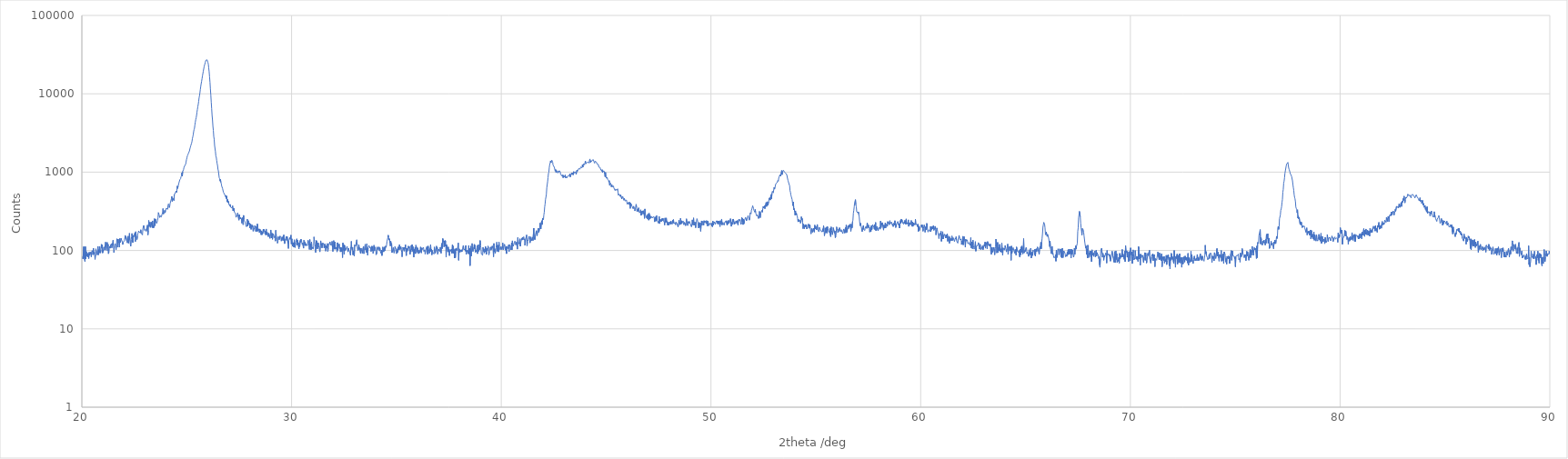
| Category | [Measurement conditions] |
|---|---|
| 20.01 | 78 |
| 20.03 | 83 |
| 20.05 | 78 |
| 20.07 | 79 |
| 20.09 | 112 |
| 20.11 | 80 |
| 20.13 | 75 |
| 20.15 | 72 |
| 20.17 | 112 |
| 20.19 | 78 |
| 20.21 | 97 |
| 20.23 | 92 |
| 20.25 | 84 |
| 20.27 | 92 |
| 20.29 | 82 |
| 20.31 | 91 |
| 20.33 | 79 |
| 20.35 | 95 |
| 20.37 | 87 |
| 20.39 | 90 |
| 20.41 | 95 |
| 20.43 | 90 |
| 20.45 | 83 |
| 20.47 | 96 |
| 20.49 | 100 |
| 20.51 | 95 |
| 20.53 | 88 |
| 20.55 | 107 |
| 20.57 | 91 |
| 20.59 | 95 |
| 20.61 | 89 |
| 20.63 | 77 |
| 20.65 | 89 |
| 20.67 | 105 |
| 20.69 | 93 |
| 20.71 | 93 |
| 20.73 | 88 |
| 20.75 | 99 |
| 20.77 | 113 |
| 20.79 | 88 |
| 20.81 | 102 |
| 20.83 | 93 |
| 20.85 | 112 |
| 20.87 | 96 |
| 20.89 | 93 |
| 20.91 | 101 |
| 20.93 | 120 |
| 20.95 | 107 |
| 20.97 | 118 |
| 20.99 | 93 |
| 21.01 | 95 |
| 21.03 | 102 |
| 21.05 | 111 |
| 21.07 | 101 |
| 21.09 | 105 |
| 21.11 | 103 |
| 21.13 | 128 |
| 21.15 | 101 |
| 21.17 | 112 |
| 21.19 | 110 |
| 21.21 | 127 |
| 21.23 | 99 |
| 21.25 | 120 |
| 21.27 | 91 |
| 21.29 | 95 |
| 21.31 | 106 |
| 21.33 | 113 |
| 21.35 | 107 |
| 21.37 | 118 |
| 21.39 | 120 |
| 21.41 | 122 |
| 21.43 | 108 |
| 21.45 | 123 |
| 21.47 | 118 |
| 21.49 | 135 |
| 21.51 | 115 |
| 21.53 | 94 |
| 21.55 | 113 |
| 21.57 | 118 |
| 21.59 | 121 |
| 21.61 | 122 |
| 21.63 | 102 |
| 21.65 | 117 |
| 21.67 | 141 |
| 21.69 | 134 |
| 21.71 | 110 |
| 21.73 | 140 |
| 21.75 | 130 |
| 21.77 | 123 |
| 21.79 | 110 |
| 21.81 | 142 |
| 21.83 | 126 |
| 21.85 | 130 |
| 21.87 | 143 |
| 21.89 | 137 |
| 21.91 | 140 |
| 21.93 | 129 |
| 21.95 | 119 |
| 21.97 | 127 |
| 21.99 | 125 |
| 22.01 | 127 |
| 22.03 | 134 |
| 22.05 | 134 |
| 22.07 | 156 |
| 22.09 | 142 |
| 22.11 | 149 |
| 22.13 | 134 |
| 22.15 | 130 |
| 22.17 | 125 |
| 22.19 | 144 |
| 22.21 | 153 |
| 22.23 | 124 |
| 22.25 | 142 |
| 22.27 | 166 |
| 22.29 | 137 |
| 22.31 | 121 |
| 22.33 | 113 |
| 22.35 | 137 |
| 22.37 | 149 |
| 22.39 | 165 |
| 22.41 | 164 |
| 22.43 | 126 |
| 22.45 | 156 |
| 22.47 | 149 |
| 22.49 | 156 |
| 22.51 | 153 |
| 22.53 | 168 |
| 22.55 | 130 |
| 22.57 | 174 |
| 22.59 | 157 |
| 22.61 | 153 |
| 22.63 | 138 |
| 22.65 | 152 |
| 22.67 | 163 |
| 22.69 | 166 |
| 22.71 | 178 |
| 22.73 | 172 |
| 22.75 | 169 |
| 22.77 | 170 |
| 22.79 | 168 |
| 22.81 | 184 |
| 22.83 | 166 |
| 22.85 | 170 |
| 22.87 | 163 |
| 22.89 | 158 |
| 22.91 | 191 |
| 22.93 | 190 |
| 22.95 | 209 |
| 22.97 | 186 |
| 22.99 | 180 |
| 23.01 | 176 |
| 23.03 | 178 |
| 23.05 | 187 |
| 23.07 | 176 |
| 23.09 | 192 |
| 23.11 | 191 |
| 23.13 | 211 |
| 23.15 | 158 |
| 23.17 | 180 |
| 23.19 | 242 |
| 23.21 | 202 |
| 23.23 | 216 |
| 23.25 | 230 |
| 23.27 | 197 |
| 23.29 | 212 |
| 23.31 | 230 |
| 23.33 | 210 |
| 23.35 | 197 |
| 23.37 | 239 |
| 23.39 | 194 |
| 23.41 | 207 |
| 23.43 | 196 |
| 23.45 | 254 |
| 23.47 | 237 |
| 23.49 | 207 |
| 23.51 | 253 |
| 23.53 | 235 |
| 23.55 | 241 |
| 23.57 | 222 |
| 23.59 | 226 |
| 23.61 | 241 |
| 23.63 | 260 |
| 23.65 | 305 |
| 23.67 | 296 |
| 23.69 | 279 |
| 23.71 | 264 |
| 23.73 | 277 |
| 23.75 | 275 |
| 23.77 | 283 |
| 23.79 | 268 |
| 23.81 | 268 |
| 23.83 | 295 |
| 23.85 | 304 |
| 23.87 | 343 |
| 23.89 | 291 |
| 23.91 | 288 |
| 23.93 | 302 |
| 23.95 | 325 |
| 23.97 | 303 |
| 23.99 | 324 |
| 24.01 | 320 |
| 24.03 | 347 |
| 24.05 | 339 |
| 24.07 | 349 |
| 24.09 | 335 |
| 24.11 | 378 |
| 24.13 | 394 |
| 24.15 | 382 |
| 24.17 | 353 |
| 24.19 | 370 |
| 24.21 | 399 |
| 24.23 | 404 |
| 24.25 | 395 |
| 24.27 | 458 |
| 24.29 | 491 |
| 24.31 | 424 |
| 24.33 | 467 |
| 24.35 | 469 |
| 24.37 | 465 |
| 24.39 | 433 |
| 24.41 | 519 |
| 24.43 | 506 |
| 24.45 | 524 |
| 24.47 | 553 |
| 24.49 | 576 |
| 24.51 | 548 |
| 24.53 | 578 |
| 24.55 | 665 |
| 24.57 | 620 |
| 24.59 | 663 |
| 24.61 | 676 |
| 24.63 | 731 |
| 24.65 | 748 |
| 24.67 | 799 |
| 24.69 | 785 |
| 24.71 | 826 |
| 24.73 | 873 |
| 24.75 | 901 |
| 24.77 | 981 |
| 24.79 | 886 |
| 24.81 | 1023 |
| 24.83 | 1047 |
| 24.85 | 1080 |
| 24.87 | 1147 |
| 24.89 | 1124 |
| 24.91 | 1215 |
| 24.93 | 1241 |
| 24.95 | 1262 |
| 24.97 | 1352 |
| 24.99 | 1448 |
| 25.01 | 1517 |
| 25.03 | 1608 |
| 25.05 | 1653 |
| 25.07 | 1635 |
| 25.09 | 1757 |
| 25.11 | 1729 |
| 25.13 | 1864 |
| 25.15 | 1972 |
| 25.17 | 2064 |
| 25.19 | 2157 |
| 25.21 | 2254 |
| 25.23 | 2329 |
| 25.25 | 2452 |
| 25.27 | 2666 |
| 25.29 | 2824 |
| 25.31 | 2990 |
| 25.33 | 3279 |
| 25.35 | 3490 |
| 25.37 | 3633 |
| 25.39 | 3991 |
| 25.41 | 4350 |
| 25.43 | 4669 |
| 25.45 | 4929 |
| 25.47 | 5288 |
| 25.49 | 5844 |
| 25.51 | 6302 |
| 25.53 | 6836 |
| 25.55 | 7305 |
| 25.57 | 7993 |
| 25.59 | 8833 |
| 25.61 | 9469 |
| 25.63 | 10294 |
| 25.65 | 11377 |
| 25.67 | 12417 |
| 25.69 | 13468 |
| 25.71 | 14402 |
| 25.73 | 15545 |
| 25.75 | 16871 |
| 25.77 | 18033 |
| 25.79 | 19420 |
| 25.81 | 20711 |
| 25.83 | 22140 |
| 25.85 | 23257 |
| 25.87 | 24316 |
| 25.89 | 25369 |
| 25.91 | 26770 |
| 25.93 | 26957 |
| 25.95 | 27285 |
| 25.97 | 27155 |
| 25.99 | 26718 |
| 26.01 | 25291 |
| 26.03 | 24001 |
| 26.05 | 21378 |
| 26.07 | 19156 |
| 26.09 | 16425 |
| 26.11 | 14041 |
| 26.13 | 11536 |
| 26.15 | 9622 |
| 26.17 | 7828 |
| 26.19 | 6472 |
| 26.21 | 5298 |
| 26.23 | 4633 |
| 26.25 | 3848 |
| 26.27 | 3411 |
| 26.29 | 2852 |
| 26.31 | 2628 |
| 26.33 | 2192 |
| 26.35 | 2151 |
| 26.37 | 1830 |
| 26.39 | 1606 |
| 26.41 | 1549 |
| 26.43 | 1407 |
| 26.45 | 1292 |
| 26.47 | 1220 |
| 26.49 | 1092 |
| 26.51 | 1039 |
| 26.53 | 1043 |
| 26.55 | 852 |
| 26.57 | 823 |
| 26.59 | 769 |
| 26.61 | 806 |
| 26.63 | 739 |
| 26.65 | 710 |
| 26.67 | 662 |
| 26.69 | 657 |
| 26.71 | 618 |
| 26.73 | 619 |
| 26.75 | 554 |
| 26.77 | 564 |
| 26.79 | 555 |
| 26.81 | 518 |
| 26.83 | 510 |
| 26.85 | 485 |
| 26.87 | 504 |
| 26.89 | 460 |
| 26.91 | 495 |
| 26.93 | 417 |
| 26.95 | 447 |
| 26.97 | 408 |
| 26.99 | 424 |
| 27.01 | 391 |
| 27.03 | 396 |
| 27.05 | 372 |
| 27.07 | 388 |
| 27.09 | 358 |
| 27.11 | 357 |
| 27.13 | 365 |
| 27.15 | 349 |
| 27.17 | 340 |
| 27.19 | 372 |
| 27.21 | 321 |
| 27.23 | 324 |
| 27.25 | 347 |
| 27.27 | 309 |
| 27.29 | 312 |
| 27.31 | 309 |
| 27.33 | 298 |
| 27.35 | 265 |
| 27.37 | 261 |
| 27.39 | 272 |
| 27.41 | 283 |
| 27.43 | 301 |
| 27.45 | 308 |
| 27.47 | 303 |
| 27.49 | 244 |
| 27.51 | 288 |
| 27.53 | 267 |
| 27.55 | 252 |
| 27.57 | 263 |
| 27.59 | 262 |
| 27.61 | 256 |
| 27.63 | 223 |
| 27.65 | 262 |
| 27.67 | 248 |
| 27.69 | 213 |
| 27.71 | 281 |
| 27.73 | 250 |
| 27.75 | 241 |
| 27.77 | 241 |
| 27.79 | 227 |
| 27.81 | 212 |
| 27.83 | 214 |
| 27.85 | 201 |
| 27.87 | 210 |
| 27.89 | 251 |
| 27.91 | 204 |
| 27.93 | 222 |
| 27.95 | 240 |
| 27.97 | 216 |
| 27.99 | 223 |
| 28.01 | 194 |
| 28.03 | 210 |
| 28.05 | 218 |
| 28.07 | 186 |
| 28.09 | 205 |
| 28.11 | 213 |
| 28.13 | 198 |
| 28.15 | 206 |
| 28.17 | 176 |
| 28.19 | 172 |
| 28.21 | 185 |
| 28.23 | 197 |
| 28.25 | 208 |
| 28.27 | 199 |
| 28.29 | 175 |
| 28.31 | 177 |
| 28.33 | 203 |
| 28.35 | 175 |
| 28.37 | 218 |
| 28.39 | 177 |
| 28.41 | 187 |
| 28.43 | 181 |
| 28.45 | 189 |
| 28.47 | 169 |
| 28.49 | 187 |
| 28.51 | 175 |
| 28.53 | 180 |
| 28.55 | 159 |
| 28.57 | 177 |
| 28.59 | 159 |
| 28.61 | 171 |
| 28.63 | 165 |
| 28.65 | 187 |
| 28.67 | 175 |
| 28.69 | 186 |
| 28.71 | 177 |
| 28.73 | 164 |
| 28.75 | 176 |
| 28.77 | 158 |
| 28.79 | 188 |
| 28.81 | 159 |
| 28.83 | 173 |
| 28.85 | 172 |
| 28.87 | 156 |
| 28.89 | 150 |
| 28.91 | 166 |
| 28.93 | 162 |
| 28.95 | 166 |
| 28.97 | 143 |
| 28.99 | 163 |
| 29.01 | 183 |
| 29.03 | 158 |
| 29.05 | 144 |
| 29.07 | 166 |
| 29.09 | 139 |
| 29.11 | 157 |
| 29.13 | 164 |
| 29.15 | 165 |
| 29.17 | 150 |
| 29.19 | 145 |
| 29.21 | 152 |
| 29.23 | 132 |
| 29.25 | 181 |
| 29.27 | 153 |
| 29.29 | 148 |
| 29.31 | 140 |
| 29.33 | 124 |
| 29.35 | 131 |
| 29.37 | 150 |
| 29.39 | 144 |
| 29.41 | 137 |
| 29.43 | 138 |
| 29.45 | 153 |
| 29.47 | 149 |
| 29.49 | 145 |
| 29.51 | 132 |
| 29.53 | 133 |
| 29.55 | 149 |
| 29.57 | 147 |
| 29.59 | 134 |
| 29.61 | 135 |
| 29.63 | 158 |
| 29.65 | 133 |
| 29.67 | 122 |
| 29.69 | 125 |
| 29.71 | 140 |
| 29.73 | 138 |
| 29.75 | 151 |
| 29.77 | 135 |
| 29.79 | 150 |
| 29.81 | 150 |
| 29.83 | 121 |
| 29.85 | 106 |
| 29.87 | 134 |
| 29.89 | 133 |
| 29.91 | 146 |
| 29.93 | 139 |
| 29.95 | 136 |
| 29.97 | 157 |
| 29.99 | 121 |
| 30.01 | 141 |
| 30.03 | 136 |
| 30.05 | 113 |
| 30.07 | 126 |
| 30.09 | 127 |
| 30.11 | 110 |
| 30.13 | 137 |
| 30.15 | 117 |
| 30.17 | 109 |
| 30.19 | 126 |
| 30.21 | 125 |
| 30.23 | 126 |
| 30.25 | 141 |
| 30.27 | 117 |
| 30.29 | 135 |
| 30.31 | 138 |
| 30.33 | 135 |
| 30.35 | 105 |
| 30.37 | 126 |
| 30.39 | 112 |
| 30.41 | 134 |
| 30.43 | 128 |
| 30.45 | 140 |
| 30.47 | 136 |
| 30.49 | 124 |
| 30.51 | 119 |
| 30.53 | 125 |
| 30.55 | 125 |
| 30.57 | 107 |
| 30.59 | 135 |
| 30.61 | 131 |
| 30.63 | 117 |
| 30.65 | 127 |
| 30.67 | 115 |
| 30.69 | 121 |
| 30.71 | 122 |
| 30.73 | 120 |
| 30.75 | 115 |
| 30.77 | 117 |
| 30.79 | 135 |
| 30.81 | 126 |
| 30.83 | 115 |
| 30.85 | 103 |
| 30.87 | 138 |
| 30.89 | 111 |
| 30.91 | 122 |
| 30.93 | 102 |
| 30.95 | 128 |
| 30.97 | 106 |
| 30.99 | 110 |
| 31.01 | 111 |
| 31.03 | 104 |
| 31.05 | 114 |
| 31.07 | 149 |
| 31.09 | 132 |
| 31.11 | 121 |
| 31.13 | 111 |
| 31.15 | 94 |
| 31.17 | 134 |
| 31.19 | 122 |
| 31.21 | 133 |
| 31.23 | 105 |
| 31.25 | 103 |
| 31.27 | 125 |
| 31.29 | 114 |
| 31.31 | 109 |
| 31.33 | 102 |
| 31.35 | 96 |
| 31.37 | 115 |
| 31.39 | 133 |
| 31.41 | 116 |
| 31.43 | 123 |
| 31.45 | 108 |
| 31.47 | 109 |
| 31.49 | 125 |
| 31.51 | 122 |
| 31.53 | 118 |
| 31.55 | 108 |
| 31.57 | 107 |
| 31.59 | 122 |
| 31.61 | 108 |
| 31.63 | 98 |
| 31.65 | 115 |
| 31.67 | 107 |
| 31.69 | 110 |
| 31.71 | 123 |
| 31.73 | 97 |
| 31.75 | 108 |
| 31.77 | 120 |
| 31.79 | 120 |
| 31.81 | 125 |
| 31.83 | 129 |
| 31.85 | 118 |
| 31.87 | 119 |
| 31.89 | 117 |
| 31.91 | 117 |
| 31.93 | 131 |
| 31.95 | 109 |
| 31.97 | 97 |
| 31.99 | 118 |
| 32.01 | 134 |
| 32.03 | 133 |
| 32.05 | 104 |
| 32.07 | 129 |
| 32.09 | 104 |
| 32.11 | 109 |
| 32.13 | 106 |
| 32.15 | 109 |
| 32.17 | 96 |
| 32.19 | 126 |
| 32.21 | 101 |
| 32.23 | 112 |
| 32.25 | 112 |
| 32.27 | 121 |
| 32.29 | 107 |
| 32.31 | 104 |
| 32.33 | 96 |
| 32.35 | 110 |
| 32.37 | 97 |
| 32.39 | 108 |
| 32.41 | 102 |
| 32.43 | 81 |
| 32.45 | 125 |
| 32.47 | 101 |
| 32.49 | 119 |
| 32.51 | 89 |
| 32.53 | 116 |
| 32.55 | 99 |
| 32.57 | 101 |
| 32.59 | 98 |
| 32.61 | 107 |
| 32.63 | 109 |
| 32.65 | 113 |
| 32.67 | 113 |
| 32.69 | 96 |
| 32.71 | 107 |
| 32.73 | 102 |
| 32.75 | 102 |
| 32.77 | 96 |
| 32.79 | 98 |
| 32.81 | 87 |
| 32.83 | 111 |
| 32.85 | 131 |
| 32.87 | 106 |
| 32.89 | 102 |
| 32.91 | 110 |
| 32.93 | 88 |
| 32.95 | 98 |
| 32.97 | 96 |
| 32.99 | 85 |
| 33.01 | 118 |
| 33.03 | 118 |
| 33.05 | 113 |
| 33.07 | 115 |
| 33.09 | 114 |
| 33.11 | 137 |
| 33.13 | 115 |
| 33.15 | 103 |
| 33.17 | 100 |
| 33.19 | 111 |
| 33.21 | 118 |
| 33.23 | 103 |
| 33.25 | 108 |
| 33.27 | 106 |
| 33.29 | 92 |
| 33.31 | 107 |
| 33.33 | 103 |
| 33.35 | 103 |
| 33.37 | 92 |
| 33.39 | 92 |
| 33.41 | 108 |
| 33.43 | 113 |
| 33.45 | 91 |
| 33.47 | 100 |
| 33.49 | 99 |
| 33.51 | 120 |
| 33.53 | 102 |
| 33.55 | 105 |
| 33.57 | 94 |
| 33.59 | 122 |
| 33.61 | 100 |
| 33.63 | 87 |
| 33.65 | 108 |
| 33.67 | 112 |
| 33.69 | 116 |
| 33.71 | 116 |
| 33.73 | 108 |
| 33.75 | 111 |
| 33.77 | 108 |
| 33.79 | 97 |
| 33.81 | 110 |
| 33.83 | 114 |
| 33.85 | 99 |
| 33.87 | 112 |
| 33.89 | 92 |
| 33.91 | 97 |
| 33.93 | 117 |
| 33.95 | 99 |
| 33.97 | 107 |
| 33.99 | 111 |
| 34.01 | 105 |
| 34.03 | 88 |
| 34.05 | 86 |
| 34.07 | 91 |
| 34.09 | 111 |
| 34.11 | 103 |
| 34.13 | 105 |
| 34.15 | 107 |
| 34.17 | 111 |
| 34.19 | 100 |
| 34.21 | 108 |
| 34.23 | 98 |
| 34.25 | 97 |
| 34.27 | 92 |
| 34.29 | 101 |
| 34.31 | 86 |
| 34.33 | 93 |
| 34.35 | 111 |
| 34.37 | 111 |
| 34.39 | 96 |
| 34.41 | 100 |
| 34.43 | 111 |
| 34.45 | 99 |
| 34.47 | 99 |
| 34.49 | 114 |
| 34.51 | 110 |
| 34.53 | 117 |
| 34.55 | 130 |
| 34.57 | 129 |
| 34.59 | 145 |
| 34.61 | 157 |
| 34.63 | 146 |
| 34.65 | 136 |
| 34.67 | 141 |
| 34.69 | 124 |
| 34.71 | 114 |
| 34.73 | 131 |
| 34.75 | 119 |
| 34.77 | 123 |
| 34.79 | 94 |
| 34.81 | 99 |
| 34.83 | 104 |
| 34.85 | 109 |
| 34.87 | 111 |
| 34.89 | 93 |
| 34.91 | 100 |
| 34.93 | 112 |
| 34.95 | 115 |
| 34.97 | 105 |
| 34.99 | 105 |
| 35.01 | 91 |
| 35.03 | 100 |
| 35.05 | 105 |
| 35.07 | 95 |
| 35.09 | 111 |
| 35.11 | 102 |
| 35.13 | 100 |
| 35.15 | 119 |
| 35.17 | 103 |
| 35.19 | 108 |
| 35.21 | 112 |
| 35.23 | 103 |
| 35.25 | 96 |
| 35.27 | 83 |
| 35.29 | 96 |
| 35.31 | 110 |
| 35.33 | 111 |
| 35.35 | 102 |
| 35.37 | 98 |
| 35.39 | 110 |
| 35.41 | 106 |
| 35.43 | 118 |
| 35.45 | 116 |
| 35.47 | 86 |
| 35.49 | 107 |
| 35.51 | 97 |
| 35.53 | 96 |
| 35.55 | 106 |
| 35.57 | 114 |
| 35.59 | 107 |
| 35.61 | 112 |
| 35.63 | 98 |
| 35.65 | 89 |
| 35.67 | 102 |
| 35.69 | 96 |
| 35.71 | 116 |
| 35.73 | 102 |
| 35.75 | 119 |
| 35.77 | 98 |
| 35.79 | 112 |
| 35.81 | 91 |
| 35.83 | 82 |
| 35.85 | 103 |
| 35.87 | 95 |
| 35.89 | 109 |
| 35.91 | 91 |
| 35.93 | 117 |
| 35.95 | 119 |
| 35.97 | 106 |
| 35.99 | 95 |
| 36.01 | 108 |
| 36.03 | 103 |
| 36.05 | 91 |
| 36.07 | 100 |
| 36.09 | 93 |
| 36.11 | 98 |
| 36.13 | 102 |
| 36.15 | 111 |
| 36.17 | 96 |
| 36.19 | 93 |
| 36.21 | 108 |
| 36.23 | 103 |
| 36.25 | 106 |
| 36.27 | 104 |
| 36.29 | 110 |
| 36.31 | 97 |
| 36.33 | 97 |
| 36.35 | 102 |
| 36.37 | 90 |
| 36.39 | 100 |
| 36.41 | 102 |
| 36.43 | 100 |
| 36.45 | 112 |
| 36.47 | 94 |
| 36.49 | 89 |
| 36.51 | 114 |
| 36.53 | 106 |
| 36.55 | 106 |
| 36.57 | 92 |
| 36.59 | 91 |
| 36.61 | 108 |
| 36.63 | 119 |
| 36.65 | 97 |
| 36.67 | 104 |
| 36.69 | 88 |
| 36.71 | 100 |
| 36.73 | 94 |
| 36.75 | 96 |
| 36.77 | 93 |
| 36.79 | 90 |
| 36.81 | 111 |
| 36.83 | 100 |
| 36.85 | 92 |
| 36.87 | 93 |
| 36.89 | 104 |
| 36.91 | 114 |
| 36.93 | 106 |
| 36.95 | 109 |
| 36.97 | 90 |
| 36.99 | 96 |
| 37.01 | 104 |
| 37.03 | 100 |
| 37.05 | 98 |
| 37.07 | 97 |
| 37.09 | 110 |
| 37.11 | 97 |
| 37.13 | 92 |
| 37.15 | 117 |
| 37.17 | 124 |
| 37.19 | 106 |
| 37.21 | 142 |
| 37.23 | 145 |
| 37.25 | 127 |
| 37.27 | 111 |
| 37.29 | 133 |
| 37.31 | 113 |
| 37.33 | 134 |
| 37.35 | 129 |
| 37.37 | 82 |
| 37.39 | 119 |
| 37.41 | 110 |
| 37.43 | 109 |
| 37.45 | 96 |
| 37.47 | 111 |
| 37.49 | 96 |
| 37.51 | 103 |
| 37.53 | 86 |
| 37.55 | 99 |
| 37.57 | 103 |
| 37.59 | 104 |
| 37.61 | 97 |
| 37.63 | 104 |
| 37.65 | 92 |
| 37.67 | 118 |
| 37.69 | 95 |
| 37.71 | 114 |
| 37.73 | 92 |
| 37.75 | 101 |
| 37.77 | 80 |
| 37.79 | 105 |
| 37.81 | 81 |
| 37.83 | 98 |
| 37.85 | 106 |
| 37.87 | 100 |
| 37.89 | 104 |
| 37.91 | 108 |
| 37.93 | 113 |
| 37.95 | 125 |
| 37.97 | 75 |
| 37.99 | 105 |
| 38.01 | 103 |
| 38.03 | 95 |
| 38.05 | 97 |
| 38.07 | 102 |
| 38.09 | 96 |
| 38.11 | 102 |
| 38.13 | 97 |
| 38.15 | 100 |
| 38.17 | 112 |
| 38.19 | 116 |
| 38.21 | 103 |
| 38.23 | 105 |
| 38.25 | 105 |
| 38.27 | 103 |
| 38.29 | 98 |
| 38.31 | 116 |
| 38.33 | 89 |
| 38.35 | 100 |
| 38.37 | 97 |
| 38.39 | 101 |
| 38.41 | 100 |
| 38.43 | 91 |
| 38.45 | 116 |
| 38.47 | 90 |
| 38.49 | 106 |
| 38.51 | 64 |
| 38.53 | 104 |
| 38.55 | 114 |
| 38.57 | 85 |
| 38.59 | 100 |
| 38.61 | 123 |
| 38.63 | 101 |
| 38.65 | 97 |
| 38.67 | 106 |
| 38.69 | 112 |
| 38.71 | 120 |
| 38.73 | 104 |
| 38.75 | 117 |
| 38.77 | 95 |
| 38.79 | 95 |
| 38.81 | 100 |
| 38.83 | 97 |
| 38.85 | 116 |
| 38.87 | 91 |
| 38.89 | 95 |
| 38.91 | 119 |
| 38.93 | 98 |
| 38.95 | 109 |
| 38.97 | 103 |
| 38.99 | 134 |
| 39.01 | 115 |
| 39.03 | 108 |
| 39.05 | 90 |
| 39.07 | 89 |
| 39.09 | 91 |
| 39.11 | 87 |
| 39.13 | 110 |
| 39.15 | 98 |
| 39.17 | 105 |
| 39.19 | 93 |
| 39.21 | 99 |
| 39.23 | 96 |
| 39.25 | 112 |
| 39.27 | 115 |
| 39.29 | 89 |
| 39.31 | 106 |
| 39.33 | 99 |
| 39.35 | 102 |
| 39.37 | 114 |
| 39.39 | 106 |
| 39.41 | 88 |
| 39.43 | 97 |
| 39.45 | 106 |
| 39.47 | 106 |
| 39.49 | 111 |
| 39.51 | 101 |
| 39.53 | 100 |
| 39.55 | 99 |
| 39.57 | 114 |
| 39.59 | 108 |
| 39.61 | 100 |
| 39.63 | 83 |
| 39.65 | 123 |
| 39.67 | 97 |
| 39.69 | 105 |
| 39.71 | 92 |
| 39.73 | 98 |
| 39.75 | 109 |
| 39.77 | 107 |
| 39.79 | 128 |
| 39.81 | 98 |
| 39.83 | 109 |
| 39.85 | 117 |
| 39.87 | 96 |
| 39.89 | 128 |
| 39.91 | 112 |
| 39.93 | 105 |
| 39.95 | 102 |
| 39.97 | 103 |
| 39.99 | 112 |
| 40.01 | 103 |
| 40.03 | 103 |
| 40.05 | 107 |
| 40.07 | 125 |
| 40.09 | 102 |
| 40.11 | 106 |
| 40.13 | 113 |
| 40.15 | 120 |
| 40.17 | 115 |
| 40.19 | 101 |
| 40.21 | 99 |
| 40.23 | 113 |
| 40.25 | 91 |
| 40.27 | 112 |
| 40.29 | 114 |
| 40.31 | 106 |
| 40.33 | 109 |
| 40.35 | 118 |
| 40.37 | 97 |
| 40.39 | 119 |
| 40.41 | 117 |
| 40.43 | 115 |
| 40.45 | 102 |
| 40.47 | 106 |
| 40.49 | 125 |
| 40.51 | 102 |
| 40.53 | 133 |
| 40.55 | 117 |
| 40.57 | 113 |
| 40.59 | 115 |
| 40.61 | 123 |
| 40.63 | 122 |
| 40.65 | 132 |
| 40.67 | 127 |
| 40.69 | 118 |
| 40.71 | 115 |
| 40.73 | 128 |
| 40.75 | 114 |
| 40.77 | 104 |
| 40.79 | 146 |
| 40.81 | 131 |
| 40.83 | 127 |
| 40.85 | 126 |
| 40.87 | 120 |
| 40.89 | 141 |
| 40.91 | 113 |
| 40.93 | 125 |
| 40.95 | 127 |
| 40.97 | 142 |
| 40.99 | 136 |
| 41.01 | 147 |
| 41.03 | 137 |
| 41.05 | 146 |
| 41.07 | 150 |
| 41.09 | 140 |
| 41.11 | 136 |
| 41.13 | 116 |
| 41.15 | 139 |
| 41.17 | 141 |
| 41.19 | 150 |
| 41.21 | 158 |
| 41.23 | 115 |
| 41.25 | 130 |
| 41.27 | 131 |
| 41.29 | 138 |
| 41.31 | 140 |
| 41.33 | 152 |
| 41.35 | 138 |
| 41.37 | 125 |
| 41.39 | 134 |
| 41.41 | 149 |
| 41.43 | 133 |
| 41.45 | 138 |
| 41.47 | 143 |
| 41.49 | 148 |
| 41.51 | 134 |
| 41.53 | 135 |
| 41.55 | 193 |
| 41.57 | 139 |
| 41.59 | 147 |
| 41.61 | 138 |
| 41.63 | 159 |
| 41.65 | 156 |
| 41.67 | 179 |
| 41.69 | 161 |
| 41.71 | 154 |
| 41.73 | 177 |
| 41.75 | 179 |
| 41.77 | 193 |
| 41.79 | 169 |
| 41.81 | 169 |
| 41.83 | 193 |
| 41.85 | 224 |
| 41.87 | 197 |
| 41.89 | 188 |
| 41.91 | 229 |
| 41.93 | 240 |
| 41.95 | 214 |
| 41.97 | 259 |
| 41.99 | 262 |
| 42.01 | 247 |
| 42.03 | 284 |
| 42.05 | 309 |
| 42.07 | 360 |
| 42.09 | 393 |
| 42.11 | 450 |
| 42.13 | 479 |
| 42.15 | 521 |
| 42.17 | 629 |
| 42.19 | 623 |
| 42.21 | 756 |
| 42.23 | 849 |
| 42.25 | 961 |
| 42.27 | 996 |
| 42.29 | 1150 |
| 42.31 | 1247 |
| 42.33 | 1309 |
| 42.35 | 1394 |
| 42.37 | 1317 |
| 42.39 | 1369 |
| 42.41 | 1423 |
| 42.43 | 1398 |
| 42.45 | 1338 |
| 42.47 | 1233 |
| 42.49 | 1243 |
| 42.51 | 1227 |
| 42.53 | 1153 |
| 42.55 | 1145 |
| 42.57 | 1034 |
| 42.59 | 1078 |
| 42.61 | 994 |
| 42.63 | 1048 |
| 42.65 | 1002 |
| 42.67 | 1013 |
| 42.69 | 975 |
| 42.71 | 1002 |
| 42.73 | 1038 |
| 42.75 | 997 |
| 42.77 | 1044 |
| 42.79 | 1039 |
| 42.81 | 1013 |
| 42.83 | 940 |
| 42.85 | 924 |
| 42.87 | 943 |
| 42.89 | 894 |
| 42.91 | 927 |
| 42.93 | 933 |
| 42.95 | 846 |
| 42.97 | 914 |
| 42.99 | 910 |
| 43.01 | 863 |
| 43.03 | 883 |
| 43.05 | 921 |
| 43.07 | 841 |
| 43.09 | 823 |
| 43.11 | 876 |
| 43.13 | 846 |
| 43.15 | 846 |
| 43.17 | 866 |
| 43.19 | 902 |
| 43.21 | 901 |
| 43.23 | 917 |
| 43.25 | 909 |
| 43.27 | 951 |
| 43.29 | 869 |
| 43.31 | 915 |
| 43.33 | 927 |
| 43.35 | 977 |
| 43.37 | 928 |
| 43.39 | 981 |
| 43.41 | 961 |
| 43.43 | 921 |
| 43.45 | 1016 |
| 43.47 | 971 |
| 43.49 | 961 |
| 43.51 | 953 |
| 43.53 | 1013 |
| 43.55 | 1010 |
| 43.57 | 936 |
| 43.59 | 959 |
| 43.61 | 1064 |
| 43.63 | 1026 |
| 43.65 | 1013 |
| 43.67 | 1037 |
| 43.69 | 1110 |
| 43.71 | 1106 |
| 43.73 | 1096 |
| 43.75 | 1092 |
| 43.77 | 1127 |
| 43.79 | 1165 |
| 43.81 | 1140 |
| 43.83 | 1167 |
| 43.85 | 1136 |
| 43.87 | 1248 |
| 43.89 | 1157 |
| 43.91 | 1242 |
| 43.93 | 1283 |
| 43.95 | 1263 |
| 43.97 | 1236 |
| 43.99 | 1250 |
| 44.01 | 1390 |
| 44.03 | 1281 |
| 44.05 | 1292 |
| 44.07 | 1315 |
| 44.09 | 1322 |
| 44.11 | 1305 |
| 44.13 | 1313 |
| 44.15 | 1346 |
| 44.17 | 1367 |
| 44.19 | 1303 |
| 44.21 | 1433 |
| 44.23 | 1473 |
| 44.25 | 1329 |
| 44.27 | 1400 |
| 44.29 | 1359 |
| 44.31 | 1348 |
| 44.33 | 1416 |
| 44.35 | 1409 |
| 44.37 | 1394 |
| 44.39 | 1441 |
| 44.41 | 1382 |
| 44.43 | 1340 |
| 44.45 | 1300 |
| 44.47 | 1380 |
| 44.49 | 1345 |
| 44.51 | 1357 |
| 44.53 | 1350 |
| 44.55 | 1325 |
| 44.57 | 1268 |
| 44.59 | 1264 |
| 44.61 | 1263 |
| 44.63 | 1252 |
| 44.65 | 1161 |
| 44.67 | 1182 |
| 44.69 | 1184 |
| 44.71 | 1149 |
| 44.73 | 1096 |
| 44.75 | 1117 |
| 44.77 | 1078 |
| 44.79 | 1029 |
| 44.81 | 1076 |
| 44.83 | 988 |
| 44.85 | 1033 |
| 44.87 | 1008 |
| 44.89 | 1008 |
| 44.91 | 1029 |
| 44.93 | 926 |
| 44.95 | 876 |
| 44.97 | 992 |
| 44.99 | 863 |
| 45.01 | 844 |
| 45.03 | 833 |
| 45.05 | 859 |
| 45.07 | 811 |
| 45.09 | 794 |
| 45.11 | 787 |
| 45.13 | 749 |
| 45.15 | 779 |
| 45.17 | 676 |
| 45.19 | 703 |
| 45.21 | 726 |
| 45.23 | 701 |
| 45.25 | 647 |
| 45.27 | 695 |
| 45.29 | 676 |
| 45.31 | 648 |
| 45.33 | 634 |
| 45.35 | 666 |
| 45.37 | 627 |
| 45.39 | 629 |
| 45.41 | 620 |
| 45.43 | 582 |
| 45.45 | 607 |
| 45.47 | 610 |
| 45.49 | 619 |
| 45.51 | 586 |
| 45.53 | 596 |
| 45.55 | 613 |
| 45.57 | 548 |
| 45.59 | 506 |
| 45.61 | 523 |
| 45.63 | 537 |
| 45.65 | 507 |
| 45.67 | 489 |
| 45.69 | 515 |
| 45.71 | 513 |
| 45.73 | 503 |
| 45.75 | 455 |
| 45.77 | 468 |
| 45.79 | 490 |
| 45.81 | 479 |
| 45.83 | 457 |
| 45.85 | 438 |
| 45.87 | 463 |
| 45.89 | 447 |
| 45.91 | 428 |
| 45.93 | 438 |
| 45.95 | 424 |
| 45.97 | 441 |
| 45.99 | 451 |
| 46.01 | 388 |
| 46.03 | 396 |
| 46.05 | 386 |
| 46.07 | 412 |
| 46.09 | 385 |
| 46.11 | 413 |
| 46.13 | 393 |
| 46.15 | 344 |
| 46.17 | 402 |
| 46.19 | 375 |
| 46.21 | 388 |
| 46.23 | 369 |
| 46.25 | 362 |
| 46.27 | 361 |
| 46.29 | 340 |
| 46.31 | 368 |
| 46.33 | 363 |
| 46.35 | 346 |
| 46.37 | 320 |
| 46.39 | 333 |
| 46.41 | 364 |
| 46.43 | 389 |
| 46.45 | 359 |
| 46.47 | 316 |
| 46.49 | 336 |
| 46.51 | 339 |
| 46.53 | 314 |
| 46.55 | 350 |
| 46.57 | 323 |
| 46.59 | 302 |
| 46.61 | 303 |
| 46.63 | 318 |
| 46.65 | 331 |
| 46.67 | 280 |
| 46.69 | 315 |
| 46.71 | 290 |
| 46.73 | 318 |
| 46.75 | 307 |
| 46.77 | 323 |
| 46.79 | 294 |
| 46.81 | 303 |
| 46.83 | 257 |
| 46.85 | 339 |
| 46.87 | 290 |
| 46.89 | 294 |
| 46.91 | 262 |
| 46.93 | 264 |
| 46.95 | 281 |
| 46.97 | 254 |
| 46.99 | 291 |
| 47.01 | 298 |
| 47.03 | 244 |
| 47.05 | 299 |
| 47.07 | 251 |
| 47.09 | 284 |
| 47.11 | 257 |
| 47.13 | 271 |
| 47.15 | 261 |
| 47.17 | 270 |
| 47.19 | 264 |
| 47.21 | 260 |
| 47.23 | 268 |
| 47.25 | 266 |
| 47.27 | 266 |
| 47.29 | 268 |
| 47.31 | 232 |
| 47.33 | 245 |
| 47.35 | 268 |
| 47.37 | 237 |
| 47.39 | 263 |
| 47.41 | 279 |
| 47.43 | 243 |
| 47.45 | 241 |
| 47.47 | 232 |
| 47.49 | 224 |
| 47.51 | 240 |
| 47.53 | 272 |
| 47.55 | 220 |
| 47.57 | 251 |
| 47.59 | 242 |
| 47.61 | 234 |
| 47.63 | 249 |
| 47.65 | 236 |
| 47.67 | 256 |
| 47.69 | 242 |
| 47.71 | 257 |
| 47.73 | 241 |
| 47.75 | 235 |
| 47.77 | 230 |
| 47.79 | 211 |
| 47.81 | 260 |
| 47.83 | 229 |
| 47.85 | 226 |
| 47.87 | 260 |
| 47.89 | 228 |
| 47.91 | 236 |
| 47.93 | 211 |
| 47.95 | 217 |
| 47.97 | 230 |
| 47.99 | 210 |
| 48.01 | 222 |
| 48.03 | 233 |
| 48.05 | 239 |
| 48.07 | 215 |
| 48.09 | 237 |
| 48.11 | 228 |
| 48.13 | 222 |
| 48.15 | 216 |
| 48.17 | 243 |
| 48.19 | 225 |
| 48.21 | 248 |
| 48.23 | 222 |
| 48.25 | 227 |
| 48.27 | 223 |
| 48.29 | 223 |
| 48.31 | 213 |
| 48.33 | 231 |
| 48.35 | 229 |
| 48.37 | 224 |
| 48.39 | 223 |
| 48.41 | 230 |
| 48.43 | 199 |
| 48.45 | 216 |
| 48.47 | 243 |
| 48.49 | 219 |
| 48.51 | 213 |
| 48.53 | 238 |
| 48.55 | 258 |
| 48.57 | 217 |
| 48.59 | 240 |
| 48.61 | 221 |
| 48.63 | 224 |
| 48.65 | 218 |
| 48.67 | 239 |
| 48.69 | 222 |
| 48.71 | 213 |
| 48.73 | 229 |
| 48.75 | 225 |
| 48.77 | 221 |
| 48.79 | 207 |
| 48.81 | 225 |
| 48.83 | 254 |
| 48.85 | 227 |
| 48.87 | 217 |
| 48.89 | 208 |
| 48.91 | 234 |
| 48.93 | 233 |
| 48.95 | 223 |
| 48.97 | 236 |
| 48.99 | 236 |
| 49.01 | 220 |
| 49.03 | 223 |
| 49.05 | 219 |
| 49.07 | 200 |
| 49.09 | 215 |
| 49.11 | 246 |
| 49.13 | 213 |
| 49.15 | 224 |
| 49.17 | 261 |
| 49.19 | 209 |
| 49.21 | 215 |
| 49.23 | 231 |
| 49.25 | 220 |
| 49.27 | 195 |
| 49.29 | 227 |
| 49.31 | 237 |
| 49.33 | 255 |
| 49.35 | 247 |
| 49.37 | 244 |
| 49.39 | 252 |
| 49.41 | 193 |
| 49.43 | 228 |
| 49.45 | 197 |
| 49.47 | 218 |
| 49.49 | 226 |
| 49.51 | 176 |
| 49.53 | 211 |
| 49.55 | 239 |
| 49.57 | 209 |
| 49.59 | 236 |
| 49.61 | 238 |
| 49.63 | 229 |
| 49.65 | 209 |
| 49.67 | 240 |
| 49.69 | 227 |
| 49.71 | 239 |
| 49.73 | 238 |
| 49.75 | 243 |
| 49.77 | 221 |
| 49.79 | 241 |
| 49.81 | 215 |
| 49.83 | 205 |
| 49.85 | 238 |
| 49.87 | 227 |
| 49.89 | 207 |
| 49.91 | 202 |
| 49.93 | 222 |
| 49.95 | 216 |
| 49.97 | 221 |
| 49.99 | 222 |
| 50.01 | 226 |
| 50.03 | 206 |
| 50.05 | 223 |
| 50.07 | 201 |
| 50.09 | 237 |
| 50.11 | 210 |
| 50.13 | 219 |
| 50.15 | 233 |
| 50.17 | 231 |
| 50.19 | 238 |
| 50.21 | 215 |
| 50.23 | 231 |
| 50.25 | 226 |
| 50.27 | 240 |
| 50.29 | 224 |
| 50.31 | 239 |
| 50.33 | 218 |
| 50.35 | 238 |
| 50.37 | 220 |
| 50.39 | 236 |
| 50.41 | 230 |
| 50.43 | 202 |
| 50.45 | 240 |
| 50.47 | 237 |
| 50.49 | 218 |
| 50.51 | 252 |
| 50.53 | 212 |
| 50.55 | 222 |
| 50.57 | 229 |
| 50.59 | 220 |
| 50.61 | 223 |
| 50.63 | 210 |
| 50.65 | 227 |
| 50.67 | 230 |
| 50.69 | 236 |
| 50.71 | 228 |
| 50.73 | 240 |
| 50.75 | 241 |
| 50.77 | 210 |
| 50.79 | 235 |
| 50.81 | 218 |
| 50.83 | 242 |
| 50.85 | 239 |
| 50.87 | 223 |
| 50.89 | 229 |
| 50.91 | 229 |
| 50.93 | 255 |
| 50.95 | 217 |
| 50.97 | 203 |
| 50.99 | 228 |
| 51.01 | 214 |
| 51.03 | 248 |
| 51.05 | 236 |
| 51.07 | 252 |
| 51.09 | 253 |
| 51.11 | 216 |
| 51.13 | 230 |
| 51.15 | 225 |
| 51.17 | 219 |
| 51.19 | 239 |
| 51.21 | 236 |
| 51.23 | 224 |
| 51.25 | 241 |
| 51.27 | 246 |
| 51.29 | 211 |
| 51.31 | 241 |
| 51.33 | 251 |
| 51.35 | 238 |
| 51.37 | 241 |
| 51.39 | 249 |
| 51.41 | 244 |
| 51.43 | 215 |
| 51.45 | 227 |
| 51.47 | 264 |
| 51.49 | 236 |
| 51.51 | 257 |
| 51.53 | 214 |
| 51.55 | 252 |
| 51.57 | 219 |
| 51.59 | 240 |
| 51.61 | 241 |
| 51.63 | 239 |
| 51.65 | 265 |
| 51.67 | 259 |
| 51.69 | 239 |
| 51.71 | 241 |
| 51.73 | 260 |
| 51.75 | 254 |
| 51.77 | 279 |
| 51.79 | 268 |
| 51.81 | 262 |
| 51.83 | 244 |
| 51.85 | 264 |
| 51.87 | 304 |
| 51.89 | 299 |
| 51.91 | 293 |
| 51.93 | 328 |
| 51.95 | 339 |
| 51.97 | 337 |
| 51.99 | 373 |
| 52.01 | 357 |
| 52.03 | 344 |
| 52.05 | 325 |
| 52.07 | 323 |
| 52.09 | 308 |
| 52.11 | 334 |
| 52.13 | 308 |
| 52.15 | 291 |
| 52.17 | 284 |
| 52.19 | 275 |
| 52.21 | 286 |
| 52.23 | 286 |
| 52.25 | 286 |
| 52.27 | 256 |
| 52.29 | 277 |
| 52.31 | 316 |
| 52.33 | 295 |
| 52.35 | 262 |
| 52.37 | 300 |
| 52.39 | 302 |
| 52.41 | 304 |
| 52.43 | 326 |
| 52.45 | 308 |
| 52.47 | 341 |
| 52.49 | 365 |
| 52.51 | 348 |
| 52.53 | 343 |
| 52.55 | 372 |
| 52.57 | 342 |
| 52.59 | 376 |
| 52.61 | 370 |
| 52.63 | 411 |
| 52.65 | 364 |
| 52.67 | 384 |
| 52.69 | 420 |
| 52.71 | 376 |
| 52.73 | 379 |
| 52.75 | 416 |
| 52.77 | 467 |
| 52.79 | 452 |
| 52.81 | 470 |
| 52.83 | 440 |
| 52.85 | 495 |
| 52.87 | 519 |
| 52.89 | 457 |
| 52.91 | 542 |
| 52.93 | 571 |
| 52.95 | 581 |
| 52.97 | 543 |
| 52.99 | 557 |
| 53.01 | 637 |
| 53.03 | 607 |
| 53.05 | 636 |
| 53.07 | 634 |
| 53.09 | 710 |
| 53.11 | 693 |
| 53.13 | 703 |
| 53.15 | 734 |
| 53.17 | 763 |
| 53.19 | 785 |
| 53.21 | 764 |
| 53.23 | 837 |
| 53.25 | 875 |
| 53.27 | 864 |
| 53.29 | 925 |
| 53.31 | 885 |
| 53.33 | 945 |
| 53.35 | 940 |
| 53.37 | 1050 |
| 53.39 | 928 |
| 53.41 | 1015 |
| 53.43 | 1015 |
| 53.45 | 1057 |
| 53.47 | 1043 |
| 53.49 | 1013 |
| 53.51 | 993 |
| 53.53 | 1009 |
| 53.55 | 977 |
| 53.57 | 977 |
| 53.59 | 989 |
| 53.61 | 935 |
| 53.63 | 884 |
| 53.65 | 862 |
| 53.67 | 788 |
| 53.69 | 755 |
| 53.71 | 755 |
| 53.73 | 695 |
| 53.75 | 673 |
| 53.77 | 580 |
| 53.79 | 556 |
| 53.81 | 512 |
| 53.83 | 488 |
| 53.85 | 482 |
| 53.87 | 447 |
| 53.89 | 399 |
| 53.91 | 372 |
| 53.93 | 418 |
| 53.95 | 331 |
| 53.97 | 342 |
| 53.99 | 310 |
| 54.01 | 282 |
| 54.03 | 321 |
| 54.05 | 284 |
| 54.07 | 299 |
| 54.09 | 286 |
| 54.11 | 278 |
| 54.13 | 257 |
| 54.15 | 232 |
| 54.17 | 250 |
| 54.19 | 251 |
| 54.21 | 233 |
| 54.23 | 234 |
| 54.25 | 243 |
| 54.27 | 223 |
| 54.29 | 238 |
| 54.31 | 270 |
| 54.33 | 246 |
| 54.35 | 256 |
| 54.37 | 229 |
| 54.39 | 190 |
| 54.41 | 217 |
| 54.43 | 213 |
| 54.45 | 190 |
| 54.47 | 209 |
| 54.49 | 215 |
| 54.51 | 198 |
| 54.53 | 207 |
| 54.55 | 214 |
| 54.57 | 188 |
| 54.59 | 192 |
| 54.61 | 199 |
| 54.63 | 194 |
| 54.65 | 218 |
| 54.67 | 215 |
| 54.69 | 192 |
| 54.71 | 214 |
| 54.73 | 204 |
| 54.75 | 202 |
| 54.77 | 163 |
| 54.79 | 180 |
| 54.81 | 191 |
| 54.83 | 178 |
| 54.85 | 171 |
| 54.87 | 175 |
| 54.89 | 193 |
| 54.91 | 197 |
| 54.93 | 172 |
| 54.95 | 211 |
| 54.97 | 189 |
| 54.99 | 203 |
| 55.01 | 190 |
| 55.03 | 183 |
| 55.05 | 179 |
| 55.07 | 215 |
| 55.09 | 184 |
| 55.11 | 179 |
| 55.13 | 180 |
| 55.15 | 173 |
| 55.17 | 197 |
| 55.19 | 190 |
| 55.21 | 195 |
| 55.23 | 191 |
| 55.25 | 176 |
| 55.27 | 173 |
| 55.29 | 174 |
| 55.31 | 173 |
| 55.33 | 189 |
| 55.35 | 175 |
| 55.37 | 207 |
| 55.39 | 184 |
| 55.41 | 154 |
| 55.43 | 168 |
| 55.45 | 194 |
| 55.47 | 168 |
| 55.49 | 177 |
| 55.51 | 199 |
| 55.53 | 167 |
| 55.55 | 202 |
| 55.57 | 193 |
| 55.59 | 181 |
| 55.61 | 180 |
| 55.63 | 170 |
| 55.65 | 178 |
| 55.67 | 191 |
| 55.69 | 158 |
| 55.71 | 150 |
| 55.73 | 200 |
| 55.75 | 181 |
| 55.77 | 178 |
| 55.79 | 159 |
| 55.81 | 173 |
| 55.83 | 196 |
| 55.85 | 192 |
| 55.87 | 193 |
| 55.89 | 167 |
| 55.91 | 177 |
| 55.93 | 146 |
| 55.95 | 150 |
| 55.97 | 169 |
| 55.99 | 200 |
| 56.01 | 194 |
| 56.03 | 196 |
| 56.05 | 169 |
| 56.07 | 175 |
| 56.09 | 188 |
| 56.11 | 176 |
| 56.13 | 195 |
| 56.15 | 185 |
| 56.17 | 183 |
| 56.19 | 173 |
| 56.21 | 185 |
| 56.23 | 186 |
| 56.25 | 173 |
| 56.27 | 175 |
| 56.29 | 164 |
| 56.31 | 180 |
| 56.33 | 188 |
| 56.35 | 177 |
| 56.37 | 167 |
| 56.39 | 184 |
| 56.41 | 196 |
| 56.43 | 168 |
| 56.45 | 211 |
| 56.47 | 179 |
| 56.49 | 171 |
| 56.51 | 191 |
| 56.53 | 207 |
| 56.55 | 190 |
| 56.57 | 192 |
| 56.59 | 211 |
| 56.61 | 198 |
| 56.63 | 201 |
| 56.65 | 217 |
| 56.67 | 176 |
| 56.69 | 197 |
| 56.71 | 216 |
| 56.73 | 195 |
| 56.75 | 233 |
| 56.77 | 244 |
| 56.79 | 299 |
| 56.81 | 323 |
| 56.83 | 360 |
| 56.85 | 406 |
| 56.87 | 405 |
| 56.89 | 446 |
| 56.91 | 381 |
| 56.93 | 362 |
| 56.95 | 312 |
| 56.97 | 317 |
| 56.99 | 314 |
| 57.01 | 302 |
| 57.03 | 312 |
| 57.05 | 286 |
| 57.07 | 267 |
| 57.09 | 233 |
| 57.11 | 207 |
| 57.13 | 223 |
| 57.15 | 208 |
| 57.17 | 199 |
| 57.19 | 204 |
| 57.21 | 174 |
| 57.23 | 195 |
| 57.25 | 200 |
| 57.27 | 209 |
| 57.29 | 185 |
| 57.31 | 190 |
| 57.33 | 180 |
| 57.35 | 190 |
| 57.37 | 188 |
| 57.39 | 203 |
| 57.41 | 207 |
| 57.43 | 191 |
| 57.45 | 226 |
| 57.47 | 212 |
| 57.49 | 196 |
| 57.51 | 211 |
| 57.53 | 200 |
| 57.55 | 192 |
| 57.57 | 172 |
| 57.59 | 185 |
| 57.61 | 198 |
| 57.63 | 175 |
| 57.65 | 208 |
| 57.67 | 184 |
| 57.69 | 196 |
| 57.71 | 214 |
| 57.73 | 215 |
| 57.75 | 204 |
| 57.77 | 195 |
| 57.79 | 187 |
| 57.81 | 215 |
| 57.83 | 184 |
| 57.85 | 228 |
| 57.87 | 178 |
| 57.89 | 189 |
| 57.91 | 203 |
| 57.93 | 204 |
| 57.95 | 200 |
| 57.97 | 178 |
| 57.99 | 194 |
| 58.01 | 196 |
| 58.03 | 197 |
| 58.05 | 197 |
| 58.07 | 187 |
| 58.09 | 237 |
| 58.11 | 196 |
| 58.13 | 222 |
| 58.15 | 210 |
| 58.17 | 227 |
| 58.19 | 205 |
| 58.21 | 204 |
| 58.23 | 182 |
| 58.25 | 212 |
| 58.27 | 193 |
| 58.29 | 203 |
| 58.31 | 225 |
| 58.33 | 194 |
| 58.35 | 211 |
| 58.37 | 218 |
| 58.39 | 216 |
| 58.41 | 203 |
| 58.43 | 234 |
| 58.45 | 222 |
| 58.47 | 229 |
| 58.49 | 234 |
| 58.51 | 213 |
| 58.53 | 240 |
| 58.55 | 220 |
| 58.57 | 223 |
| 58.59 | 222 |
| 58.61 | 231 |
| 58.63 | 231 |
| 58.65 | 209 |
| 58.67 | 217 |
| 58.69 | 202 |
| 58.71 | 211 |
| 58.73 | 225 |
| 58.75 | 209 |
| 58.77 | 240 |
| 58.79 | 221 |
| 58.81 | 196 |
| 58.83 | 199 |
| 58.85 | 218 |
| 58.87 | 217 |
| 58.89 | 213 |
| 58.91 | 235 |
| 58.93 | 220 |
| 58.95 | 210 |
| 58.97 | 221 |
| 58.99 | 193 |
| 59.01 | 215 |
| 59.03 | 241 |
| 59.05 | 222 |
| 59.07 | 252 |
| 59.09 | 234 |
| 59.11 | 246 |
| 59.13 | 226 |
| 59.15 | 229 |
| 59.17 | 230 |
| 59.19 | 216 |
| 59.21 | 232 |
| 59.23 | 221 |
| 59.25 | 242 |
| 59.27 | 245 |
| 59.29 | 216 |
| 59.31 | 253 |
| 59.33 | 219 |
| 59.35 | 218 |
| 59.37 | 226 |
| 59.39 | 216 |
| 59.41 | 246 |
| 59.43 | 203 |
| 59.45 | 201 |
| 59.47 | 226 |
| 59.49 | 225 |
| 59.51 | 212 |
| 59.53 | 233 |
| 59.55 | 242 |
| 59.57 | 225 |
| 59.59 | 203 |
| 59.61 | 231 |
| 59.63 | 203 |
| 59.65 | 226 |
| 59.67 | 211 |
| 59.69 | 222 |
| 59.71 | 226 |
| 59.73 | 212 |
| 59.75 | 250 |
| 59.77 | 215 |
| 59.79 | 215 |
| 59.81 | 214 |
| 59.83 | 214 |
| 59.85 | 201 |
| 59.87 | 217 |
| 59.89 | 175 |
| 59.91 | 205 |
| 59.93 | 179 |
| 59.95 | 187 |
| 59.97 | 186 |
| 59.99 | 200 |
| 60.01 | 202 |
| 60.03 | 212 |
| 60.05 | 197 |
| 60.07 | 213 |
| 60.09 | 205 |
| 60.11 | 176 |
| 60.13 | 190 |
| 60.15 | 203 |
| 60.17 | 212 |
| 60.19 | 200 |
| 60.21 | 171 |
| 60.23 | 200 |
| 60.25 | 189 |
| 60.27 | 184 |
| 60.29 | 222 |
| 60.31 | 215 |
| 60.33 | 181 |
| 60.35 | 172 |
| 60.37 | 176 |
| 60.39 | 184 |
| 60.41 | 185 |
| 60.43 | 187 |
| 60.45 | 174 |
| 60.47 | 203 |
| 60.49 | 176 |
| 60.51 | 194 |
| 60.53 | 186 |
| 60.55 | 202 |
| 60.57 | 188 |
| 60.59 | 193 |
| 60.61 | 208 |
| 60.63 | 181 |
| 60.65 | 186 |
| 60.67 | 197 |
| 60.69 | 204 |
| 60.71 | 186 |
| 60.73 | 158 |
| 60.75 | 181 |
| 60.77 | 194 |
| 60.79 | 186 |
| 60.81 | 173 |
| 60.83 | 173 |
| 60.85 | 157 |
| 60.87 | 142 |
| 60.89 | 161 |
| 60.91 | 160 |
| 60.93 | 168 |
| 60.95 | 156 |
| 60.97 | 176 |
| 60.99 | 131 |
| 61.01 | 155 |
| 61.03 | 156 |
| 61.05 | 174 |
| 61.07 | 140 |
| 61.09 | 155 |
| 61.11 | 153 |
| 61.13 | 162 |
| 61.15 | 166 |
| 61.17 | 162 |
| 61.19 | 144 |
| 61.21 | 159 |
| 61.23 | 146 |
| 61.25 | 156 |
| 61.27 | 163 |
| 61.29 | 131 |
| 61.31 | 148 |
| 61.33 | 153 |
| 61.35 | 143 |
| 61.37 | 123 |
| 61.39 | 149 |
| 61.41 | 132 |
| 61.43 | 130 |
| 61.45 | 142 |
| 61.47 | 134 |
| 61.49 | 153 |
| 61.51 | 134 |
| 61.53 | 142 |
| 61.55 | 146 |
| 61.57 | 145 |
| 61.59 | 145 |
| 61.61 | 130 |
| 61.63 | 131 |
| 61.65 | 144 |
| 61.67 | 140 |
| 61.69 | 150 |
| 61.71 | 135 |
| 61.73 | 129 |
| 61.75 | 127 |
| 61.77 | 124 |
| 61.79 | 140 |
| 61.81 | 144 |
| 61.83 | 156 |
| 61.85 | 143 |
| 61.87 | 143 |
| 61.89 | 136 |
| 61.91 | 135 |
| 61.93 | 141 |
| 61.95 | 119 |
| 61.97 | 132 |
| 61.99 | 121 |
| 62.01 | 152 |
| 62.03 | 118 |
| 62.05 | 142 |
| 62.07 | 151 |
| 62.09 | 137 |
| 62.11 | 126 |
| 62.13 | 110 |
| 62.15 | 139 |
| 62.17 | 132 |
| 62.19 | 131 |
| 62.21 | 137 |
| 62.23 | 133 |
| 62.25 | 122 |
| 62.27 | 124 |
| 62.29 | 122 |
| 62.31 | 126 |
| 62.33 | 125 |
| 62.35 | 116 |
| 62.37 | 124 |
| 62.39 | 146 |
| 62.41 | 108 |
| 62.43 | 128 |
| 62.45 | 116 |
| 62.47 | 105 |
| 62.49 | 136 |
| 62.51 | 118 |
| 62.53 | 108 |
| 62.55 | 104 |
| 62.57 | 108 |
| 62.59 | 108 |
| 62.61 | 130 |
| 62.63 | 98 |
| 62.65 | 109 |
| 62.67 | 115 |
| 62.69 | 115 |
| 62.71 | 114 |
| 62.73 | 116 |
| 62.75 | 126 |
| 62.77 | 121 |
| 62.79 | 109 |
| 62.81 | 104 |
| 62.83 | 120 |
| 62.85 | 116 |
| 62.87 | 102 |
| 62.89 | 104 |
| 62.91 | 104 |
| 62.93 | 111 |
| 62.95 | 115 |
| 62.97 | 102 |
| 62.99 | 102 |
| 63.01 | 113 |
| 63.03 | 119 |
| 63.05 | 113 |
| 63.07 | 128 |
| 63.09 | 107 |
| 63.11 | 127 |
| 63.13 | 120 |
| 63.15 | 116 |
| 63.17 | 105 |
| 63.19 | 130 |
| 63.21 | 131 |
| 63.23 | 119 |
| 63.25 | 115 |
| 63.27 | 121 |
| 63.29 | 113 |
| 63.31 | 114 |
| 63.33 | 121 |
| 63.35 | 93 |
| 63.37 | 89 |
| 63.39 | 104 |
| 63.41 | 110 |
| 63.43 | 95 |
| 63.45 | 99 |
| 63.47 | 100 |
| 63.49 | 110 |
| 63.51 | 98 |
| 63.53 | 88 |
| 63.55 | 104 |
| 63.57 | 112 |
| 63.59 | 140 |
| 63.61 | 113 |
| 63.63 | 93 |
| 63.65 | 95 |
| 63.67 | 127 |
| 63.69 | 94 |
| 63.71 | 109 |
| 63.73 | 99 |
| 63.75 | 101 |
| 63.77 | 120 |
| 63.79 | 97 |
| 63.81 | 100 |
| 63.83 | 105 |
| 63.85 | 95 |
| 63.87 | 124 |
| 63.89 | 97 |
| 63.91 | 87 |
| 63.93 | 108 |
| 63.95 | 106 |
| 63.97 | 108 |
| 63.99 | 101 |
| 64.01 | 109 |
| 64.03 | 116 |
| 64.05 | 108 |
| 64.07 | 107 |
| 64.09 | 96 |
| 64.11 | 104 |
| 64.13 | 106 |
| 64.15 | 121 |
| 64.17 | 89 |
| 64.19 | 106 |
| 64.21 | 107 |
| 64.23 | 112 |
| 64.25 | 99 |
| 64.27 | 104 |
| 64.29 | 113 |
| 64.31 | 75 |
| 64.33 | 114 |
| 64.35 | 92 |
| 64.37 | 99 |
| 64.39 | 98 |
| 64.41 | 109 |
| 64.43 | 105 |
| 64.45 | 99 |
| 64.47 | 98 |
| 64.49 | 92 |
| 64.51 | 103 |
| 64.53 | 93 |
| 64.55 | 87 |
| 64.57 | 111 |
| 64.59 | 114 |
| 64.61 | 98 |
| 64.63 | 100 |
| 64.65 | 95 |
| 64.67 | 96 |
| 64.69 | 100 |
| 64.71 | 85 |
| 64.73 | 82 |
| 64.75 | 104 |
| 64.77 | 88 |
| 64.79 | 111 |
| 64.81 | 95 |
| 64.83 | 114 |
| 64.85 | 98 |
| 64.87 | 90 |
| 64.89 | 110 |
| 64.91 | 142 |
| 64.93 | 93 |
| 64.95 | 97 |
| 64.97 | 101 |
| 64.99 | 97 |
| 65.01 | 95 |
| 65.03 | 109 |
| 65.05 | 105 |
| 65.07 | 91 |
| 65.09 | 95 |
| 65.11 | 94 |
| 65.13 | 93 |
| 65.15 | 84 |
| 65.17 | 102 |
| 65.19 | 90 |
| 65.21 | 94 |
| 65.23 | 88 |
| 65.25 | 107 |
| 65.27 | 80 |
| 65.29 | 85 |
| 65.31 | 95 |
| 65.33 | 86 |
| 65.35 | 101 |
| 65.37 | 102 |
| 65.39 | 99 |
| 65.41 | 98 |
| 65.43 | 88 |
| 65.45 | 104 |
| 65.47 | 85 |
| 65.49 | 99 |
| 65.51 | 105 |
| 65.53 | 97 |
| 65.55 | 106 |
| 65.57 | 111 |
| 65.59 | 105 |
| 65.61 | 106 |
| 65.63 | 105 |
| 65.65 | 89 |
| 65.67 | 107 |
| 65.69 | 113 |
| 65.71 | 105 |
| 65.73 | 127 |
| 65.75 | 105 |
| 65.77 | 128 |
| 65.79 | 143 |
| 65.81 | 164 |
| 65.83 | 198 |
| 65.85 | 213 |
| 65.87 | 229 |
| 65.89 | 224 |
| 65.91 | 216 |
| 65.93 | 194 |
| 65.95 | 159 |
| 65.97 | 164 |
| 65.99 | 173 |
| 66.01 | 158 |
| 66.03 | 151 |
| 66.05 | 161 |
| 66.07 | 156 |
| 66.09 | 160 |
| 66.11 | 140 |
| 66.13 | 125 |
| 66.15 | 112 |
| 66.17 | 131 |
| 66.19 | 106 |
| 66.21 | 104 |
| 66.23 | 91 |
| 66.25 | 110 |
| 66.27 | 113 |
| 66.29 | 89 |
| 66.31 | 92 |
| 66.33 | 86 |
| 66.35 | 81 |
| 66.37 | 83 |
| 66.39 | 83 |
| 66.41 | 82 |
| 66.43 | 88 |
| 66.45 | 73 |
| 66.47 | 101 |
| 66.49 | 81 |
| 66.51 | 84 |
| 66.53 | 99 |
| 66.55 | 105 |
| 66.57 | 100 |
| 66.59 | 88 |
| 66.61 | 92 |
| 66.63 | 105 |
| 66.65 | 97 |
| 66.67 | 92 |
| 66.69 | 83 |
| 66.71 | 104 |
| 66.73 | 80 |
| 66.75 | 107 |
| 66.77 | 88 |
| 66.79 | 81 |
| 66.81 | 96 |
| 66.83 | 99 |
| 66.85 | 98 |
| 66.87 | 94 |
| 66.89 | 90 |
| 66.91 | 83 |
| 66.93 | 81 |
| 66.95 | 88 |
| 66.97 | 84 |
| 66.99 | 95 |
| 67.01 | 88 |
| 67.03 | 102 |
| 67.05 | 89 |
| 67.07 | 104 |
| 67.09 | 90 |
| 67.11 | 98 |
| 67.13 | 91 |
| 67.15 | 104 |
| 67.17 | 80 |
| 67.19 | 103 |
| 67.21 | 89 |
| 67.23 | 102 |
| 67.25 | 95 |
| 67.27 | 94 |
| 67.29 | 82 |
| 67.31 | 86 |
| 67.33 | 107 |
| 67.35 | 89 |
| 67.37 | 105 |
| 67.39 | 115 |
| 67.41 | 104 |
| 67.43 | 113 |
| 67.45 | 114 |
| 67.47 | 124 |
| 67.49 | 175 |
| 67.51 | 194 |
| 67.53 | 260 |
| 67.55 | 254 |
| 67.57 | 316 |
| 67.59 | 310 |
| 67.61 | 269 |
| 67.63 | 223 |
| 67.65 | 194 |
| 67.67 | 177 |
| 67.69 | 157 |
| 67.71 | 191 |
| 67.73 | 194 |
| 67.75 | 184 |
| 67.77 | 172 |
| 67.79 | 154 |
| 67.81 | 151 |
| 67.83 | 125 |
| 67.85 | 122 |
| 67.87 | 107 |
| 67.89 | 114 |
| 67.91 | 89 |
| 67.93 | 104 |
| 67.95 | 80 |
| 67.97 | 117 |
| 67.99 | 109 |
| 68.01 | 81 |
| 68.03 | 93 |
| 68.05 | 88 |
| 68.07 | 99 |
| 68.09 | 91 |
| 68.11 | 83 |
| 68.13 | 98 |
| 68.15 | 72 |
| 68.17 | 102 |
| 68.19 | 90 |
| 68.21 | 87 |
| 68.23 | 93 |
| 68.25 | 84 |
| 68.27 | 92 |
| 68.29 | 91 |
| 68.31 | 99 |
| 68.33 | 83 |
| 68.35 | 86 |
| 68.37 | 101 |
| 68.39 | 85 |
| 68.41 | 94 |
| 68.43 | 91 |
| 68.45 | 89 |
| 68.47 | 87 |
| 68.49 | 79 |
| 68.51 | 83 |
| 68.53 | 65 |
| 68.55 | 61 |
| 68.57 | 79 |
| 68.59 | 101 |
| 68.61 | 99 |
| 68.63 | 107 |
| 68.65 | 92 |
| 68.67 | 82 |
| 68.69 | 92 |
| 68.71 | 86 |
| 68.73 | 75 |
| 68.75 | 86 |
| 68.77 | 83 |
| 68.79 | 84 |
| 68.81 | 82 |
| 68.83 | 93 |
| 68.85 | 87 |
| 68.87 | 69 |
| 68.89 | 100 |
| 68.91 | 87 |
| 68.93 | 85 |
| 68.95 | 87 |
| 68.97 | 91 |
| 68.99 | 85 |
| 69.01 | 88 |
| 69.03 | 77 |
| 69.05 | 73 |
| 69.07 | 80 |
| 69.09 | 78 |
| 69.11 | 79 |
| 69.13 | 98 |
| 69.15 | 97 |
| 69.17 | 81 |
| 69.19 | 78 |
| 69.21 | 71 |
| 69.23 | 84 |
| 69.25 | 97 |
| 69.27 | 70 |
| 69.29 | 88 |
| 69.31 | 99 |
| 69.33 | 77 |
| 69.35 | 91 |
| 69.37 | 70 |
| 69.39 | 71 |
| 69.41 | 76 |
| 69.43 | 73 |
| 69.45 | 82 |
| 69.47 | 69 |
| 69.49 | 92 |
| 69.51 | 78 |
| 69.53 | 76 |
| 69.55 | 86 |
| 69.57 | 82 |
| 69.59 | 80 |
| 69.61 | 103 |
| 69.63 | 83 |
| 69.65 | 90 |
| 69.67 | 91 |
| 69.69 | 90 |
| 69.71 | 77 |
| 69.73 | 98 |
| 69.75 | 72 |
| 69.77 | 116 |
| 69.79 | 99 |
| 69.81 | 94 |
| 69.83 | 99 |
| 69.85 | 82 |
| 69.87 | 96 |
| 69.89 | 95 |
| 69.91 | 72 |
| 69.93 | 79 |
| 69.95 | 97 |
| 69.97 | 95 |
| 69.99 | 74 |
| 70.01 | 108 |
| 70.03 | 109 |
| 70.05 | 88 |
| 70.07 | 96 |
| 70.09 | 68 |
| 70.11 | 83 |
| 70.13 | 102 |
| 70.15 | 93 |
| 70.17 | 76 |
| 70.19 | 75 |
| 70.21 | 80 |
| 70.23 | 100 |
| 70.25 | 87 |
| 70.27 | 78 |
| 70.29 | 84 |
| 70.31 | 77 |
| 70.33 | 84 |
| 70.35 | 82 |
| 70.37 | 72 |
| 70.39 | 112 |
| 70.41 | 104 |
| 70.43 | 78 |
| 70.45 | 89 |
| 70.47 | 65 |
| 70.49 | 90 |
| 70.51 | 80 |
| 70.53 | 87 |
| 70.55 | 84 |
| 70.57 | 83 |
| 70.59 | 87 |
| 70.61 | 73 |
| 70.63 | 70 |
| 70.65 | 82 |
| 70.67 | 82 |
| 70.69 | 94 |
| 70.71 | 75 |
| 70.73 | 93 |
| 70.75 | 84 |
| 70.77 | 69 |
| 70.79 | 73 |
| 70.81 | 73 |
| 70.83 | 92 |
| 70.85 | 86 |
| 70.87 | 84 |
| 70.89 | 96 |
| 70.91 | 101 |
| 70.93 | 78 |
| 70.95 | 72 |
| 70.97 | 69 |
| 70.99 | 70 |
| 71.01 | 83 |
| 71.03 | 89 |
| 71.05 | 85 |
| 71.07 | 91 |
| 71.09 | 74 |
| 71.11 | 73 |
| 71.13 | 89 |
| 71.15 | 83 |
| 71.17 | 62 |
| 71.19 | 79 |
| 71.21 | 81 |
| 71.23 | 78 |
| 71.25 | 75 |
| 71.27 | 81 |
| 71.29 | 79 |
| 71.31 | 96 |
| 71.33 | 95 |
| 71.35 | 81 |
| 71.37 | 76 |
| 71.39 | 93 |
| 71.41 | 77 |
| 71.43 | 81 |
| 71.45 | 85 |
| 71.47 | 74 |
| 71.49 | 91 |
| 71.51 | 62 |
| 71.53 | 72 |
| 71.55 | 83 |
| 71.57 | 81 |
| 71.59 | 75 |
| 71.61 | 84 |
| 71.63 | 69 |
| 71.65 | 75 |
| 71.67 | 72 |
| 71.69 | 79 |
| 71.71 | 87 |
| 71.73 | 66 |
| 71.75 | 74 |
| 71.77 | 87 |
| 71.79 | 81 |
| 71.81 | 88 |
| 71.83 | 76 |
| 71.85 | 64 |
| 71.87 | 82 |
| 71.89 | 58 |
| 71.91 | 79 |
| 71.93 | 75 |
| 71.95 | 92 |
| 71.97 | 89 |
| 71.99 | 77 |
| 72.01 | 83 |
| 72.03 | 81 |
| 72.05 | 84 |
| 72.07 | 68 |
| 72.09 | 100 |
| 72.11 | 81 |
| 72.13 | 71 |
| 72.15 | 61 |
| 72.17 | 84 |
| 72.19 | 79 |
| 72.21 | 78 |
| 72.23 | 90 |
| 72.25 | 67 |
| 72.27 | 87 |
| 72.29 | 88 |
| 72.31 | 70 |
| 72.33 | 69 |
| 72.35 | 91 |
| 72.37 | 73 |
| 72.39 | 69 |
| 72.41 | 81 |
| 72.43 | 73 |
| 72.45 | 61 |
| 72.47 | 82 |
| 72.49 | 79 |
| 72.51 | 67 |
| 72.53 | 71 |
| 72.55 | 83 |
| 72.57 | 79 |
| 72.59 | 71 |
| 72.61 | 85 |
| 72.63 | 76 |
| 72.65 | 81 |
| 72.67 | 75 |
| 72.69 | 82 |
| 72.71 | 78 |
| 72.73 | 69 |
| 72.75 | 92 |
| 72.77 | 65 |
| 72.79 | 81 |
| 72.81 | 76 |
| 72.83 | 70 |
| 72.85 | 76 |
| 72.87 | 81 |
| 72.89 | 98 |
| 72.91 | 72 |
| 72.93 | 88 |
| 72.95 | 78 |
| 72.97 | 73 |
| 72.99 | 68 |
| 73.01 | 76 |
| 73.03 | 78 |
| 73.05 | 85 |
| 73.07 | 84 |
| 73.09 | 74 |
| 73.11 | 77 |
| 73.13 | 77 |
| 73.15 | 80 |
| 73.17 | 74 |
| 73.19 | 89 |
| 73.21 | 80 |
| 73.23 | 74 |
| 73.25 | 81 |
| 73.27 | 80 |
| 73.29 | 75 |
| 73.31 | 74 |
| 73.33 | 91 |
| 73.35 | 88 |
| 73.37 | 77 |
| 73.39 | 84 |
| 73.41 | 74 |
| 73.43 | 85 |
| 73.45 | 79 |
| 73.47 | 81 |
| 73.49 | 80 |
| 73.51 | 73 |
| 73.53 | 80 |
| 73.55 | 87 |
| 73.57 | 117 |
| 73.59 | 91 |
| 73.61 | 97 |
| 73.63 | 86 |
| 73.65 | 85 |
| 73.67 | 81 |
| 73.69 | 76 |
| 73.71 | 77 |
| 73.73 | 80 |
| 73.75 | 88 |
| 73.77 | 79 |
| 73.79 | 92 |
| 73.81 | 92 |
| 73.83 | 90 |
| 73.85 | 92 |
| 73.87 | 87 |
| 73.89 | 70 |
| 73.91 | 85 |
| 73.93 | 86 |
| 73.95 | 79 |
| 73.97 | 84 |
| 73.99 | 74 |
| 74.01 | 94 |
| 74.03 | 90 |
| 74.05 | 83 |
| 74.07 | 79 |
| 74.09 | 77 |
| 74.11 | 81 |
| 74.13 | 106 |
| 74.15 | 85 |
| 74.17 | 84 |
| 74.19 | 95 |
| 74.21 | 80 |
| 74.23 | 73 |
| 74.25 | 89 |
| 74.27 | 86 |
| 74.29 | 84 |
| 74.31 | 81 |
| 74.33 | 100 |
| 74.35 | 73 |
| 74.37 | 82 |
| 74.39 | 88 |
| 74.41 | 75 |
| 74.43 | 91 |
| 74.45 | 68 |
| 74.47 | 96 |
| 74.49 | 98 |
| 74.51 | 90 |
| 74.53 | 92 |
| 74.55 | 71 |
| 74.57 | 79 |
| 74.59 | 67 |
| 74.61 | 84 |
| 74.63 | 86 |
| 74.65 | 79 |
| 74.67 | 85 |
| 74.69 | 78 |
| 74.71 | 84 |
| 74.73 | 68 |
| 74.75 | 77 |
| 74.77 | 90 |
| 74.79 | 93 |
| 74.81 | 100 |
| 74.83 | 75 |
| 74.85 | 75 |
| 74.87 | 99 |
| 74.89 | 86 |
| 74.91 | 88 |
| 74.93 | 84 |
| 74.95 | 84 |
| 74.97 | 78 |
| 74.99 | 83 |
| 75.01 | 62 |
| 75.03 | 83 |
| 75.05 | 86 |
| 75.07 | 87 |
| 75.09 | 87 |
| 75.11 | 86 |
| 75.13 | 87 |
| 75.15 | 90 |
| 75.17 | 76 |
| 75.19 | 77 |
| 75.21 | 79 |
| 75.23 | 71 |
| 75.25 | 93 |
| 75.27 | 89 |
| 75.29 | 83 |
| 75.31 | 88 |
| 75.33 | 106 |
| 75.35 | 108 |
| 75.37 | 90 |
| 75.39 | 92 |
| 75.41 | 85 |
| 75.43 | 81 |
| 75.45 | 81 |
| 75.47 | 89 |
| 75.49 | 84 |
| 75.51 | 74 |
| 75.53 | 86 |
| 75.55 | 98 |
| 75.57 | 85 |
| 75.59 | 96 |
| 75.61 | 87 |
| 75.63 | 79 |
| 75.65 | 75 |
| 75.67 | 86 |
| 75.69 | 84 |
| 75.71 | 104 |
| 75.73 | 81 |
| 75.75 | 100 |
| 75.77 | 87 |
| 75.79 | 102 |
| 75.81 | 113 |
| 75.83 | 95 |
| 75.85 | 102 |
| 75.87 | 87 |
| 75.89 | 101 |
| 75.91 | 109 |
| 75.93 | 102 |
| 75.95 | 107 |
| 75.97 | 101 |
| 75.99 | 103 |
| 76.01 | 79 |
| 76.03 | 114 |
| 76.05 | 81 |
| 76.07 | 127 |
| 76.09 | 124 |
| 76.11 | 123 |
| 76.13 | 155 |
| 76.15 | 166 |
| 76.17 | 174 |
| 76.19 | 185 |
| 76.21 | 121 |
| 76.23 | 146 |
| 76.25 | 136 |
| 76.27 | 123 |
| 76.29 | 117 |
| 76.31 | 126 |
| 76.33 | 132 |
| 76.35 | 125 |
| 76.37 | 136 |
| 76.39 | 131 |
| 76.41 | 133 |
| 76.43 | 117 |
| 76.45 | 138 |
| 76.47 | 124 |
| 76.49 | 161 |
| 76.51 | 149 |
| 76.53 | 141 |
| 76.55 | 164 |
| 76.57 | 124 |
| 76.59 | 123 |
| 76.61 | 144 |
| 76.63 | 106 |
| 76.65 | 107 |
| 76.67 | 110 |
| 76.69 | 108 |
| 76.71 | 132 |
| 76.73 | 117 |
| 76.75 | 121 |
| 76.77 | 125 |
| 76.79 | 117 |
| 76.81 | 118 |
| 76.83 | 105 |
| 76.85 | 129 |
| 76.87 | 122 |
| 76.89 | 136 |
| 76.91 | 127 |
| 76.93 | 122 |
| 76.95 | 136 |
| 76.97 | 152 |
| 76.99 | 142 |
| 77.01 | 152 |
| 77.03 | 195 |
| 77.05 | 203 |
| 77.07 | 186 |
| 77.09 | 200 |
| 77.11 | 254 |
| 77.13 | 250 |
| 77.15 | 283 |
| 77.17 | 325 |
| 77.19 | 339 |
| 77.21 | 362 |
| 77.23 | 410 |
| 77.25 | 449 |
| 77.27 | 553 |
| 77.29 | 602 |
| 77.31 | 724 |
| 77.33 | 768 |
| 77.35 | 847 |
| 77.37 | 968 |
| 77.39 | 1040 |
| 77.41 | 1055 |
| 77.43 | 1198 |
| 77.45 | 1268 |
| 77.47 | 1261 |
| 77.49 | 1282 |
| 77.51 | 1334 |
| 77.53 | 1221 |
| 77.55 | 1124 |
| 77.57 | 1084 |
| 77.59 | 1078 |
| 77.61 | 999 |
| 77.63 | 950 |
| 77.65 | 946 |
| 77.67 | 906 |
| 77.69 | 877 |
| 77.71 | 861 |
| 77.73 | 775 |
| 77.75 | 693 |
| 77.77 | 638 |
| 77.79 | 587 |
| 77.81 | 515 |
| 77.83 | 476 |
| 77.85 | 457 |
| 77.87 | 420 |
| 77.89 | 358 |
| 77.91 | 345 |
| 77.93 | 332 |
| 77.95 | 303 |
| 77.97 | 331 |
| 77.99 | 259 |
| 78.01 | 275 |
| 78.03 | 253 |
| 78.05 | 265 |
| 78.07 | 262 |
| 78.09 | 218 |
| 78.11 | 233 |
| 78.13 | 212 |
| 78.15 | 230 |
| 78.17 | 216 |
| 78.19 | 196 |
| 78.21 | 207 |
| 78.23 | 199 |
| 78.25 | 203 |
| 78.27 | 198 |
| 78.29 | 206 |
| 78.31 | 196 |
| 78.33 | 196 |
| 78.35 | 198 |
| 78.37 | 171 |
| 78.39 | 186 |
| 78.41 | 195 |
| 78.43 | 158 |
| 78.45 | 162 |
| 78.47 | 175 |
| 78.49 | 167 |
| 78.51 | 177 |
| 78.53 | 179 |
| 78.55 | 156 |
| 78.57 | 168 |
| 78.59 | 183 |
| 78.61 | 140 |
| 78.63 | 180 |
| 78.65 | 167 |
| 78.67 | 147 |
| 78.69 | 161 |
| 78.71 | 141 |
| 78.73 | 153 |
| 78.75 | 173 |
| 78.77 | 135 |
| 78.79 | 160 |
| 78.81 | 148 |
| 78.83 | 139 |
| 78.85 | 132 |
| 78.87 | 158 |
| 78.89 | 151 |
| 78.91 | 138 |
| 78.93 | 132 |
| 78.95 | 137 |
| 78.97 | 148 |
| 78.99 | 161 |
| 79.01 | 138 |
| 79.03 | 147 |
| 79.05 | 132 |
| 79.07 | 153 |
| 79.09 | 166 |
| 79.11 | 123 |
| 79.13 | 137 |
| 79.15 | 152 |
| 79.17 | 149 |
| 79.19 | 129 |
| 79.21 | 136 |
| 79.23 | 140 |
| 79.25 | 136 |
| 79.27 | 122 |
| 79.29 | 147 |
| 79.31 | 148 |
| 79.33 | 126 |
| 79.35 | 129 |
| 79.37 | 133 |
| 79.39 | 160 |
| 79.41 | 143 |
| 79.43 | 130 |
| 79.45 | 144 |
| 79.47 | 142 |
| 79.49 | 143 |
| 79.51 | 147 |
| 79.53 | 149 |
| 79.55 | 133 |
| 79.57 | 139 |
| 79.59 | 143 |
| 79.61 | 153 |
| 79.63 | 149 |
| 79.65 | 142 |
| 79.67 | 130 |
| 79.69 | 140 |
| 79.71 | 144 |
| 79.73 | 145 |
| 79.75 | 149 |
| 79.77 | 139 |
| 79.79 | 140 |
| 79.81 | 136 |
| 79.83 | 145 |
| 79.85 | 145 |
| 79.87 | 141 |
| 79.89 | 127 |
| 79.91 | 168 |
| 79.93 | 144 |
| 79.95 | 158 |
| 79.97 | 149 |
| 79.99 | 161 |
| 80.01 | 196 |
| 80.03 | 174 |
| 80.05 | 180 |
| 80.07 | 164 |
| 80.09 | 182 |
| 80.11 | 120 |
| 80.13 | 140 |
| 80.15 | 142 |
| 80.17 | 139 |
| 80.19 | 153 |
| 80.21 | 162 |
| 80.23 | 181 |
| 80.25 | 153 |
| 80.27 | 177 |
| 80.29 | 164 |
| 80.31 | 156 |
| 80.33 | 138 |
| 80.35 | 149 |
| 80.37 | 141 |
| 80.39 | 120 |
| 80.41 | 140 |
| 80.43 | 146 |
| 80.45 | 132 |
| 80.47 | 144 |
| 80.49 | 151 |
| 80.51 | 136 |
| 80.53 | 145 |
| 80.55 | 139 |
| 80.57 | 169 |
| 80.59 | 147 |
| 80.61 | 135 |
| 80.63 | 152 |
| 80.65 | 160 |
| 80.67 | 146 |
| 80.69 | 131 |
| 80.71 | 161 |
| 80.73 | 130 |
| 80.75 | 156 |
| 80.77 | 157 |
| 80.79 | 157 |
| 80.81 | 156 |
| 80.83 | 153 |
| 80.85 | 146 |
| 80.87 | 140 |
| 80.89 | 154 |
| 80.91 | 140 |
| 80.93 | 162 |
| 80.95 | 144 |
| 80.97 | 148 |
| 80.99 | 165 |
| 81.01 | 152 |
| 81.03 | 141 |
| 81.05 | 172 |
| 81.07 | 168 |
| 81.09 | 156 |
| 81.11 | 155 |
| 81.13 | 190 |
| 81.15 | 156 |
| 81.17 | 151 |
| 81.19 | 181 |
| 81.21 | 160 |
| 81.23 | 188 |
| 81.25 | 179 |
| 81.27 | 159 |
| 81.29 | 159 |
| 81.31 | 181 |
| 81.33 | 157 |
| 81.35 | 154 |
| 81.37 | 177 |
| 81.39 | 161 |
| 81.41 | 152 |
| 81.43 | 193 |
| 81.45 | 171 |
| 81.47 | 180 |
| 81.49 | 169 |
| 81.51 | 184 |
| 81.53 | 171 |
| 81.55 | 192 |
| 81.57 | 189 |
| 81.59 | 205 |
| 81.61 | 199 |
| 81.63 | 189 |
| 81.65 | 201 |
| 81.67 | 177 |
| 81.69 | 209 |
| 81.71 | 184 |
| 81.73 | 179 |
| 81.75 | 192 |
| 81.77 | 171 |
| 81.79 | 207 |
| 81.81 | 198 |
| 81.83 | 218 |
| 81.85 | 229 |
| 81.87 | 187 |
| 81.89 | 209 |
| 81.91 | 190 |
| 81.93 | 204 |
| 81.95 | 210 |
| 81.97 | 192 |
| 81.99 | 223 |
| 82.01 | 235 |
| 82.03 | 212 |
| 82.05 | 216 |
| 82.07 | 225 |
| 82.09 | 214 |
| 82.11 | 226 |
| 82.13 | 244 |
| 82.15 | 242 |
| 82.17 | 240 |
| 82.19 | 228 |
| 82.21 | 264 |
| 82.23 | 247 |
| 82.25 | 234 |
| 82.27 | 258 |
| 82.29 | 272 |
| 82.31 | 255 |
| 82.33 | 233 |
| 82.35 | 277 |
| 82.37 | 276 |
| 82.39 | 289 |
| 82.41 | 276 |
| 82.43 | 274 |
| 82.45 | 312 |
| 82.47 | 283 |
| 82.49 | 293 |
| 82.51 | 293 |
| 82.53 | 320 |
| 82.55 | 300 |
| 82.57 | 282 |
| 82.59 | 294 |
| 82.61 | 313 |
| 82.63 | 335 |
| 82.65 | 317 |
| 82.67 | 323 |
| 82.69 | 366 |
| 82.71 | 359 |
| 82.73 | 371 |
| 82.75 | 359 |
| 82.77 | 347 |
| 82.79 | 347 |
| 82.81 | 393 |
| 82.83 | 385 |
| 82.85 | 355 |
| 82.87 | 380 |
| 82.89 | 390 |
| 82.91 | 411 |
| 82.93 | 364 |
| 82.95 | 408 |
| 82.97 | 430 |
| 82.99 | 411 |
| 83.01 | 460 |
| 83.03 | 437 |
| 83.05 | 494 |
| 83.07 | 440 |
| 83.09 | 405 |
| 83.11 | 443 |
| 83.13 | 478 |
| 83.15 | 465 |
| 83.17 | 470 |
| 83.19 | 479 |
| 83.21 | 504 |
| 83.23 | 525 |
| 83.25 | 520 |
| 83.27 | 499 |
| 83.29 | 507 |
| 83.31 | 500 |
| 83.33 | 510 |
| 83.35 | 484 |
| 83.37 | 491 |
| 83.39 | 468 |
| 83.41 | 513 |
| 83.43 | 510 |
| 83.45 | 506 |
| 83.47 | 519 |
| 83.49 | 506 |
| 83.51 | 531 |
| 83.53 | 493 |
| 83.55 | 503 |
| 83.57 | 468 |
| 83.59 | 491 |
| 83.61 | 503 |
| 83.63 | 514 |
| 83.65 | 505 |
| 83.67 | 486 |
| 83.69 | 487 |
| 83.71 | 491 |
| 83.73 | 458 |
| 83.75 | 461 |
| 83.77 | 430 |
| 83.79 | 439 |
| 83.81 | 472 |
| 83.83 | 422 |
| 83.85 | 433 |
| 83.87 | 438 |
| 83.89 | 400 |
| 83.91 | 403 |
| 83.93 | 436 |
| 83.95 | 378 |
| 83.97 | 372 |
| 83.99 | 399 |
| 84.01 | 355 |
| 84.03 | 347 |
| 84.05 | 376 |
| 84.07 | 335 |
| 84.09 | 355 |
| 84.11 | 319 |
| 84.13 | 310 |
| 84.15 | 362 |
| 84.17 | 296 |
| 84.19 | 311 |
| 84.21 | 311 |
| 84.23 | 310 |
| 84.25 | 312 |
| 84.27 | 298 |
| 84.29 | 276 |
| 84.31 | 307 |
| 84.33 | 294 |
| 84.35 | 319 |
| 84.37 | 301 |
| 84.39 | 297 |
| 84.41 | 271 |
| 84.43 | 271 |
| 84.45 | 270 |
| 84.47 | 268 |
| 84.49 | 313 |
| 84.51 | 269 |
| 84.53 | 277 |
| 84.55 | 257 |
| 84.57 | 262 |
| 84.59 | 260 |
| 84.61 | 235 |
| 84.63 | 251 |
| 84.65 | 245 |
| 84.67 | 261 |
| 84.69 | 271 |
| 84.71 | 280 |
| 84.73 | 261 |
| 84.75 | 260 |
| 84.77 | 221 |
| 84.79 | 226 |
| 84.81 | 231 |
| 84.83 | 256 |
| 84.85 | 235 |
| 84.87 | 241 |
| 84.89 | 209 |
| 84.91 | 241 |
| 84.93 | 218 |
| 84.95 | 220 |
| 84.97 | 239 |
| 84.99 | 235 |
| 85.01 | 234 |
| 85.03 | 228 |
| 85.05 | 219 |
| 85.07 | 214 |
| 85.09 | 237 |
| 85.11 | 209 |
| 85.13 | 215 |
| 85.15 | 225 |
| 85.17 | 218 |
| 85.19 | 200 |
| 85.21 | 201 |
| 85.23 | 199 |
| 85.25 | 201 |
| 85.27 | 214 |
| 85.29 | 203 |
| 85.31 | 196 |
| 85.33 | 212 |
| 85.35 | 173 |
| 85.37 | 162 |
| 85.39 | 200 |
| 85.41 | 193 |
| 85.43 | 171 |
| 85.45 | 170 |
| 85.47 | 160 |
| 85.49 | 150 |
| 85.51 | 166 |
| 85.53 | 160 |
| 85.55 | 177 |
| 85.57 | 187 |
| 85.59 | 180 |
| 85.61 | 179 |
| 85.63 | 191 |
| 85.65 | 175 |
| 85.67 | 192 |
| 85.69 | 169 |
| 85.71 | 166 |
| 85.73 | 178 |
| 85.75 | 160 |
| 85.77 | 170 |
| 85.79 | 156 |
| 85.81 | 164 |
| 85.83 | 143 |
| 85.85 | 143 |
| 85.87 | 144 |
| 85.89 | 132 |
| 85.91 | 162 |
| 85.93 | 143 |
| 85.95 | 151 |
| 85.97 | 155 |
| 85.99 | 139 |
| 86.01 | 120 |
| 86.03 | 147 |
| 86.05 | 150 |
| 86.07 | 130 |
| 86.09 | 140 |
| 86.11 | 153 |
| 86.13 | 144 |
| 86.15 | 150 |
| 86.17 | 137 |
| 86.19 | 133 |
| 86.21 | 106 |
| 86.23 | 141 |
| 86.25 | 102 |
| 86.27 | 123 |
| 86.29 | 137 |
| 86.31 | 119 |
| 86.33 | 114 |
| 86.35 | 135 |
| 86.37 | 123 |
| 86.39 | 113 |
| 86.41 | 138 |
| 86.43 | 119 |
| 86.45 | 109 |
| 86.47 | 128 |
| 86.49 | 114 |
| 86.51 | 120 |
| 86.53 | 116 |
| 86.55 | 117 |
| 86.57 | 132 |
| 86.59 | 95 |
| 86.61 | 104 |
| 86.63 | 115 |
| 86.65 | 103 |
| 86.67 | 107 |
| 86.69 | 120 |
| 86.71 | 109 |
| 86.73 | 102 |
| 86.75 | 103 |
| 86.77 | 107 |
| 86.79 | 112 |
| 86.81 | 99 |
| 86.83 | 101 |
| 86.85 | 108 |
| 86.87 | 102 |
| 86.89 | 108 |
| 86.91 | 111 |
| 86.93 | 110 |
| 86.95 | 95 |
| 86.97 | 117 |
| 86.99 | 117 |
| 87.01 | 120 |
| 87.03 | 113 |
| 87.05 | 116 |
| 87.07 | 104 |
| 87.09 | 120 |
| 87.11 | 116 |
| 87.13 | 100 |
| 87.15 | 111 |
| 87.17 | 104 |
| 87.19 | 108 |
| 87.21 | 103 |
| 87.23 | 89 |
| 87.25 | 102 |
| 87.27 | 103 |
| 87.29 | 111 |
| 87.31 | 99 |
| 87.33 | 89 |
| 87.35 | 91 |
| 87.37 | 92 |
| 87.39 | 99 |
| 87.41 | 106 |
| 87.43 | 91 |
| 87.45 | 103 |
| 87.47 | 87 |
| 87.49 | 107 |
| 87.51 | 93 |
| 87.53 | 91 |
| 87.55 | 111 |
| 87.57 | 112 |
| 87.59 | 87 |
| 87.61 | 99 |
| 87.63 | 105 |
| 87.65 | 98 |
| 87.67 | 95 |
| 87.69 | 81 |
| 87.71 | 107 |
| 87.73 | 107 |
| 87.75 | 97 |
| 87.77 | 108 |
| 87.79 | 97 |
| 87.81 | 83 |
| 87.83 | 96 |
| 87.85 | 95 |
| 87.87 | 82 |
| 87.89 | 86 |
| 87.91 | 82 |
| 87.93 | 97 |
| 87.95 | 93 |
| 87.97 | 87 |
| 87.99 | 87 |
| 88.01 | 86 |
| 88.03 | 106 |
| 88.05 | 95 |
| 88.07 | 82 |
| 88.09 | 94 |
| 88.11 | 100 |
| 88.13 | 90 |
| 88.15 | 111 |
| 88.17 | 101 |
| 88.19 | 112 |
| 88.21 | 133 |
| 88.23 | 129 |
| 88.25 | 98 |
| 88.27 | 104 |
| 88.29 | 120 |
| 88.31 | 118 |
| 88.33 | 114 |
| 88.35 | 104 |
| 88.37 | 120 |
| 88.39 | 102 |
| 88.41 | 92 |
| 88.43 | 97 |
| 88.45 | 108 |
| 88.47 | 91 |
| 88.49 | 111 |
| 88.51 | 113 |
| 88.53 | 127 |
| 88.55 | 84 |
| 88.57 | 108 |
| 88.59 | 101 |
| 88.61 | 94 |
| 88.63 | 94 |
| 88.65 | 88 |
| 88.67 | 99 |
| 88.69 | 80 |
| 88.71 | 85 |
| 88.73 | 82 |
| 88.75 | 80 |
| 88.77 | 88 |
| 88.79 | 88 |
| 88.81 | 86 |
| 88.83 | 77 |
| 88.85 | 85 |
| 88.87 | 77 |
| 88.89 | 90 |
| 88.91 | 85 |
| 88.93 | 81 |
| 88.95 | 78 |
| 88.97 | 81 |
| 88.99 | 115 |
| 89.01 | 66 |
| 89.03 | 82 |
| 89.05 | 62 |
| 89.07 | 68 |
| 89.09 | 73 |
| 89.11 | 99 |
| 89.13 | 85 |
| 89.15 | 87 |
| 89.17 | 86 |
| 89.19 | 80 |
| 89.21 | 90 |
| 89.23 | 78 |
| 89.25 | 84 |
| 89.27 | 98 |
| 89.29 | 85 |
| 89.31 | 79 |
| 89.33 | 83 |
| 89.35 | 66 |
| 89.37 | 78 |
| 89.39 | 89 |
| 89.41 | 81 |
| 89.43 | 98 |
| 89.45 | 75 |
| 89.47 | 87 |
| 89.49 | 69 |
| 89.51 | 92 |
| 89.53 | 85 |
| 89.55 | 90 |
| 89.57 | 80 |
| 89.59 | 89 |
| 89.61 | 67 |
| 89.63 | 63 |
| 89.65 | 82 |
| 89.67 | 71 |
| 89.69 | 68 |
| 89.71 | 84 |
| 89.73 | 103 |
| 89.75 | 85 |
| 89.77 | 72 |
| 89.79 | 82 |
| 89.81 | 82 |
| 89.83 | 99 |
| 89.85 | 98 |
| 89.87 | 84 |
| 89.89 | 91 |
| 89.91 | 89 |
| 89.93 | 89 |
| 89.95 | 89 |
| 89.97 | 98 |
| 89.99 | 91 |